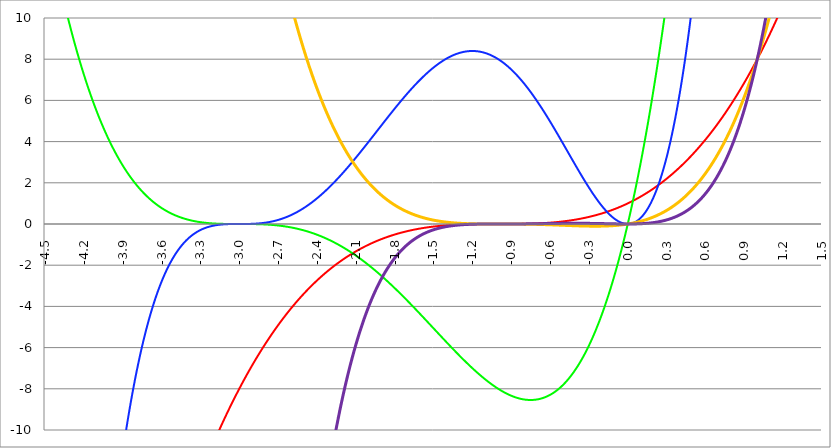
| Category | Series 1 | Series 0 | Series 2 | Series 3 | Series 4 |
|---|---|---|---|---|---|
| -4.5 | -42.875 | 15.188 | -68.344 | 192.938 | -868.219 |
| -4.497 | -42.765 | 15.086 | -67.844 | 192.314 | -864.834 |
| -4.494 | -42.655 | 14.986 | -67.347 | 191.691 | -861.459 |
| -4.491 | -42.545 | 14.886 | -66.853 | 191.07 | -858.096 |
| -4.488 | -42.436 | 14.786 | -66.361 | 190.451 | -854.742 |
| -4.484999999999999 | -42.326 | 14.687 | -65.873 | 189.833 | -851.399 |
| -4.482 | -42.217 | 14.589 | -65.387 | 189.216 | -848.067 |
| -4.479 | -42.108 | 14.491 | -64.903 | 188.601 | -844.745 |
| -4.476 | -41.999 | 14.393 | -64.423 | 187.988 | -841.433 |
| -4.472999999999999 | -41.89 | 14.296 | -63.945 | 187.376 | -838.131 |
| -4.469999999999999 | -41.782 | 14.199 | -63.47 | 186.765 | -834.84 |
| -4.466999999999999 | -41.674 | 14.103 | -62.997 | 186.156 | -831.56 |
| -4.463999999999999 | -41.566 | 14.007 | -62.528 | 185.549 | -828.289 |
| -4.460999999999998 | -41.458 | 13.912 | -62.06 | 184.943 | -825.029 |
| -4.457999999999998 | -41.35 | 13.817 | -61.596 | 184.338 | -821.779 |
| -4.454999999999998 | -41.242 | 13.723 | -61.134 | 183.735 | -818.539 |
| -4.451999999999998 | -41.135 | 13.629 | -60.675 | 183.133 | -815.31 |
| -4.448999999999998 | -41.028 | 13.535 | -60.219 | 182.533 | -812.09 |
| -4.445999999999998 | -40.921 | 13.442 | -59.765 | 181.935 | -808.881 |
| -4.442999999999998 | -40.814 | 13.35 | -59.313 | 181.337 | -805.682 |
| -4.439999999999997 | -40.708 | 13.258 | -58.864 | 180.742 | -802.493 |
| -4.436999999999997 | -40.601 | 13.166 | -58.418 | 180.147 | -799.314 |
| -4.433999999999997 | -40.495 | 13.075 | -57.975 | 179.555 | -796.145 |
| -4.430999999999997 | -40.389 | 12.984 | -57.534 | 178.963 | -792.986 |
| -4.427999999999997 | -40.283 | 12.894 | -57.095 | 178.373 | -789.837 |
| -4.424999999999997 | -40.177 | 12.804 | -56.659 | 177.785 | -786.698 |
| -4.421999999999997 | -40.072 | 12.715 | -56.226 | 177.198 | -783.569 |
| -4.418999999999997 | -39.967 | 12.626 | -55.795 | 176.612 | -780.45 |
| -4.415999999999997 | -39.861 | 12.538 | -55.367 | 176.028 | -777.341 |
| -4.412999999999997 | -39.757 | 12.45 | -54.941 | 175.446 | -774.242 |
| -4.409999999999996 | -39.652 | 12.362 | -54.517 | 174.865 | -771.153 |
| -4.406999999999996 | -39.547 | 12.275 | -54.096 | 174.285 | -768.073 |
| -4.403999999999996 | -39.443 | 12.188 | -53.678 | 173.706 | -765.003 |
| -4.400999999999996 | -39.339 | 12.102 | -53.262 | 173.13 | -761.943 |
| -4.397999999999996 | -39.235 | 12.016 | -52.848 | 172.554 | -758.893 |
| -4.394999999999996 | -39.131 | 11.931 | -52.437 | 171.98 | -755.853 |
| -4.391999999999996 | -39.027 | 11.846 | -52.029 | 171.408 | -752.822 |
| -4.388999999999996 | -38.924 | 11.762 | -51.622 | 170.836 | -749.801 |
| -4.385999999999996 | -38.82 | 11.678 | -51.219 | 170.267 | -746.789 |
| -4.382999999999996 | -38.717 | 11.594 | -50.817 | 169.698 | -743.788 |
| -4.379999999999995 | -38.614 | 11.511 | -50.418 | 169.131 | -740.795 |
| -4.376999999999995 | -38.512 | 11.428 | -50.021 | 168.566 | -737.813 |
| -4.373999999999995 | -38.409 | 11.346 | -49.627 | 168.002 | -734.84 |
| -4.370999999999995 | -38.307 | 11.264 | -49.235 | 167.439 | -731.877 |
| -4.367999999999995 | -38.205 | 11.183 | -48.845 | 166.878 | -728.923 |
| -4.364999999999995 | -38.103 | 11.102 | -48.458 | 166.318 | -725.978 |
| -4.361999999999995 | -38.001 | 11.021 | -48.073 | 165.76 | -723.044 |
| -4.358999999999995 | -37.899 | 10.941 | -47.691 | 165.203 | -720.118 |
| -4.355999999999994 | -37.798 | 10.861 | -47.31 | 164.647 | -717.202 |
| -4.352999999999994 | -37.696 | 10.782 | -46.932 | 164.093 | -714.296 |
| -4.349999999999994 | -37.595 | 10.703 | -46.556 | 163.54 | -711.398 |
| -4.346999999999994 | -37.494 | 10.624 | -46.183 | 162.988 | -708.511 |
| -4.343999999999994 | -37.394 | 10.546 | -45.812 | 162.438 | -705.632 |
| -4.340999999999994 | -37.293 | 10.468 | -45.443 | 161.89 | -702.763 |
| -4.337999999999994 | -37.193 | 10.391 | -45.076 | 161.342 | -699.903 |
| -4.334999999999994 | -37.093 | 10.314 | -44.712 | 160.797 | -697.053 |
| -4.331999999999994 | -36.993 | 10.238 | -44.35 | 160.252 | -694.212 |
| -4.328999999999993 | -36.893 | 10.162 | -43.99 | 159.709 | -691.38 |
| -4.325999999999993 | -36.793 | 10.086 | -43.632 | 159.167 | -688.557 |
| -4.322999999999993 | -36.694 | 10.011 | -43.276 | 158.627 | -685.743 |
| -4.319999999999993 | -36.594 | 9.936 | -42.923 | 158.088 | -682.939 |
| -4.316999999999993 | -36.495 | 9.861 | -42.572 | 157.55 | -680.143 |
| -4.313999999999993 | -36.396 | 9.787 | -42.223 | 157.014 | -677.357 |
| -4.310999999999993 | -36.298 | 9.714 | -41.876 | 156.479 | -674.58 |
| -4.307999999999993 | -36.199 | 9.64 | -41.531 | 155.945 | -671.812 |
| -4.304999999999993 | -36.101 | 9.568 | -41.189 | 155.413 | -669.053 |
| -4.301999999999992 | -36.002 | 9.495 | -40.848 | 154.882 | -666.303 |
| -4.298999999999992 | -35.904 | 9.423 | -40.51 | 154.353 | -663.563 |
| -4.295999999999992 | -35.806 | 9.351 | -40.174 | 153.825 | -660.831 |
| -4.292999999999992 | -35.709 | 9.28 | -39.84 | 153.298 | -658.108 |
| -4.289999999999992 | -35.611 | 9.209 | -39.508 | 152.772 | -655.394 |
| -4.286999999999992 | -35.514 | 9.139 | -39.178 | 152.248 | -652.689 |
| -4.283999999999992 | -35.417 | 9.069 | -38.85 | 151.726 | -649.993 |
| -4.280999999999992 | -35.32 | 8.999 | -38.525 | 151.204 | -647.305 |
| -4.277999999999992 | -35.223 | 8.93 | -38.201 | 150.684 | -644.627 |
| -4.274999999999991 | -35.126 | 8.861 | -37.879 | 150.165 | -641.957 |
| -4.271999999999991 | -35.03 | 8.792 | -37.56 | 149.648 | -639.297 |
| -4.268999999999991 | -34.934 | 8.724 | -37.242 | 149.132 | -636.645 |
| -4.265999999999991 | -34.838 | 8.656 | -36.927 | 148.617 | -634.001 |
| -4.262999999999991 | -34.742 | 8.589 | -36.613 | 148.104 | -631.367 |
| -4.259999999999991 | -34.646 | 8.522 | -36.302 | 147.592 | -628.741 |
| -4.256999999999991 | -34.55 | 8.455 | -35.993 | 147.081 | -626.124 |
| -4.253999999999991 | -34.455 | 8.389 | -35.685 | 146.572 | -623.516 |
| -4.250999999999991 | -34.36 | 8.323 | -35.38 | 146.064 | -620.916 |
| -4.24799999999999 | -34.265 | 8.257 | -35.076 | 145.557 | -618.325 |
| -4.24499999999999 | -34.17 | 8.192 | -34.775 | 145.051 | -615.743 |
| -4.24199999999999 | -34.075 | 8.127 | -34.475 | 144.547 | -613.169 |
| -4.23899999999999 | -33.981 | 8.063 | -34.178 | 144.044 | -610.604 |
| -4.23599999999999 | -33.886 | 7.999 | -33.882 | 143.543 | -608.047 |
| -4.23299999999999 | -33.792 | 7.935 | -33.588 | 143.043 | -605.499 |
| -4.22999999999999 | -33.698 | 7.871 | -33.296 | 142.544 | -602.96 |
| -4.22699999999999 | -33.604 | 7.808 | -33.006 | 142.046 | -600.429 |
| -4.22399999999999 | -33.511 | 7.746 | -32.718 | 141.55 | -597.906 |
| -4.220999999999989 | -33.417 | 7.684 | -32.432 | 141.055 | -595.392 |
| -4.217999999999989 | -33.324 | 7.622 | -32.148 | 140.561 | -592.886 |
| -4.214999999999989 | -33.231 | 7.56 | -31.866 | 140.069 | -590.389 |
| -4.21199999999999 | -33.138 | 7.499 | -31.585 | 139.577 | -587.9 |
| -4.208999999999989 | -33.045 | 7.438 | -31.307 | 139.087 | -585.419 |
| -4.205999999999989 | -32.953 | 7.378 | -31.03 | 138.599 | -582.947 |
| -4.202999999999989 | -32.86 | 7.317 | -30.755 | 138.112 | -580.483 |
| -4.199999999999989 | -32.768 | 7.258 | -30.482 | 137.626 | -578.028 |
| -4.196999999999988 | -32.676 | 7.198 | -30.211 | 137.141 | -575.58 |
| -4.193999999999988 | -32.584 | 7.139 | -29.941 | 136.657 | -573.141 |
| -4.190999999999988 | -32.492 | 7.08 | -29.674 | 136.175 | -570.71 |
| -4.187999999999988 | -32.401 | 7.022 | -29.408 | 135.694 | -568.288 |
| -4.184999999999988 | -32.309 | 6.964 | -29.144 | 135.215 | -565.873 |
| -4.181999999999988 | -32.218 | 6.906 | -28.882 | 134.736 | -563.467 |
| -4.178999999999988 | -32.127 | 6.849 | -28.621 | 134.259 | -561.069 |
| -4.175999999999988 | -32.036 | 6.792 | -28.362 | 133.783 | -558.679 |
| -4.172999999999988 | -31.946 | 6.735 | -28.105 | 133.309 | -556.297 |
| -4.169999999999987 | -31.855 | 6.679 | -27.85 | 132.835 | -553.924 |
| -4.166999999999987 | -31.765 | 6.623 | -27.597 | 132.363 | -551.558 |
| -4.163999999999987 | -31.674 | 6.567 | -27.345 | 131.893 | -549.2 |
| -4.160999999999987 | -31.584 | 6.512 | -27.095 | 131.423 | -546.851 |
| -4.157999999999987 | -31.495 | 6.457 | -26.847 | 130.955 | -544.509 |
| -4.154999999999987 | -31.405 | 6.402 | -26.6 | 130.488 | -542.176 |
| -4.151999999999987 | -31.315 | 6.348 | -26.356 | 130.022 | -539.85 |
| -4.148999999999987 | -31.226 | 6.294 | -26.112 | 129.557 | -537.533 |
| -4.145999999999987 | -31.137 | 6.24 | -25.871 | 129.094 | -535.223 |
| -4.142999999999986 | -31.048 | 6.187 | -25.631 | 128.632 | -532.921 |
| -4.139999999999986 | -30.959 | 6.134 | -25.393 | 128.171 | -530.627 |
| -4.136999999999986 | -30.87 | 6.081 | -25.157 | 127.711 | -528.341 |
| -4.133999999999986 | -30.782 | 6.029 | -24.922 | 127.253 | -526.063 |
| -4.130999999999986 | -30.694 | 5.976 | -24.689 | 126.796 | -523.793 |
| -4.127999999999986 | -30.606 | 5.925 | -24.457 | 126.34 | -521.53 |
| -4.124999999999986 | -30.518 | 5.873 | -24.227 | 125.885 | -519.276 |
| -4.121999999999986 | -30.43 | 5.822 | -23.999 | 125.432 | -517.029 |
| -4.118999999999986 | -30.342 | 5.771 | -23.772 | 124.979 | -514.79 |
| -4.115999999999985 | -30.255 | 5.721 | -23.547 | 124.528 | -512.558 |
| -4.112999999999985 | -30.167 | 5.671 | -23.324 | 124.078 | -510.334 |
| -4.109999999999985 | -30.08 | 5.621 | -23.102 | 123.63 | -508.118 |
| -4.106999999999985 | -29.993 | 5.571 | -22.882 | 123.182 | -505.91 |
| -4.103999999999985 | -29.906 | 5.522 | -22.663 | 122.736 | -503.709 |
| -4.100999999999985 | -29.82 | 5.473 | -22.446 | 122.291 | -501.516 |
| -4.097999999999985 | -29.733 | 5.425 | -22.231 | 121.847 | -499.331 |
| -4.094999999999985 | -29.647 | 5.376 | -22.017 | 121.405 | -497.153 |
| -4.091999999999984 | -29.561 | 5.328 | -21.804 | 120.963 | -494.982 |
| -4.088999999999984 | -29.475 | 5.281 | -21.593 | 120.523 | -492.82 |
| -4.085999999999984 | -29.389 | 5.233 | -21.384 | 120.084 | -490.664 |
| -4.082999999999984 | -29.304 | 5.186 | -21.176 | 119.646 | -488.517 |
| -4.079999999999984 | -29.218 | 5.14 | -20.97 | 119.21 | -486.376 |
| -4.076999999999984 | -29.133 | 5.093 | -20.765 | 118.774 | -484.244 |
| -4.073999999999984 | -29.048 | 5.047 | -20.562 | 118.34 | -482.118 |
| -4.070999999999984 | -28.963 | 5.001 | -20.36 | 117.907 | -480 |
| -4.067999999999984 | -28.878 | 4.956 | -20.159 | 117.475 | -477.89 |
| -4.064999999999984 | -28.793 | 4.91 | -19.96 | 117.045 | -475.787 |
| -4.061999999999983 | -28.709 | 4.865 | -19.763 | 116.615 | -473.691 |
| -4.058999999999983 | -28.625 | 4.821 | -19.567 | 116.187 | -471.603 |
| -4.055999999999983 | -28.54 | 4.776 | -19.373 | 115.76 | -469.522 |
| -4.052999999999983 | -28.456 | 4.732 | -19.18 | 115.334 | -467.448 |
| -4.049999999999983 | -28.373 | 4.688 | -18.988 | 114.909 | -465.382 |
| -4.046999999999983 | -28.289 | 4.645 | -18.798 | 114.486 | -463.323 |
| -4.043999999999983 | -28.206 | 4.602 | -18.609 | 114.063 | -461.271 |
| -4.040999999999983 | -28.122 | 4.559 | -18.422 | 113.642 | -459.227 |
| -4.037999999999982 | -28.039 | 4.516 | -18.236 | 113.222 | -457.189 |
| -4.034999999999982 | -27.956 | 4.474 | -18.051 | 112.803 | -455.159 |
| -4.031999999999982 | -27.873 | 4.432 | -17.868 | 112.385 | -453.136 |
| -4.028999999999982 | -27.791 | 4.39 | -17.686 | 111.968 | -451.12 |
| -4.025999999999982 | -27.708 | 4.348 | -17.506 | 111.553 | -449.112 |
| -4.022999999999982 | -27.626 | 4.307 | -17.327 | 111.138 | -447.11 |
| -4.019999999999982 | -27.544 | 4.266 | -17.15 | 110.725 | -445.116 |
| -4.016999999999982 | -27.462 | 4.225 | -16.973 | 110.313 | -443.128 |
| -4.013999999999982 | -27.38 | 4.185 | -16.798 | 109.902 | -441.148 |
| -4.010999999999981 | -27.298 | 4.145 | -16.625 | 109.493 | -439.175 |
| -4.007999999999981 | -27.217 | 4.105 | -16.453 | 109.084 | -437.209 |
| -4.004999999999981 | -27.135 | 4.065 | -16.282 | 108.677 | -435.25 |
| -4.001999999999981 | -27.054 | 4.026 | -16.112 | 108.27 | -433.298 |
| -3.998999999999981 | -26.973 | 3.987 | -15.944 | 107.865 | -431.352 |
| -3.995999999999981 | -26.892 | 3.948 | -15.777 | 107.461 | -429.414 |
| -3.992999999999981 | -26.811 | 3.91 | -15.612 | 107.058 | -427.483 |
| -3.989999999999981 | -26.731 | 3.871 | -15.447 | 106.656 | -425.559 |
| -3.986999999999981 | -26.651 | 3.834 | -15.284 | 106.256 | -423.641 |
| -3.98399999999998 | -26.57 | 3.796 | -15.123 | 105.856 | -421.731 |
| -3.98099999999998 | -26.49 | 3.758 | -14.962 | 105.458 | -419.827 |
| -3.97799999999998 | -26.41 | 3.721 | -14.803 | 105.06 | -417.93 |
| -3.97499999999998 | -26.331 | 3.684 | -14.645 | 104.664 | -416.04 |
| -3.97199999999998 | -26.251 | 3.648 | -14.488 | 104.269 | -414.157 |
| -3.96899999999998 | -26.172 | 3.611 | -14.333 | 103.875 | -412.28 |
| -3.96599999999998 | -26.092 | 3.575 | -14.179 | 103.482 | -410.411 |
| -3.96299999999998 | -26.013 | 3.539 | -14.026 | 103.091 | -408.548 |
| -3.95999999999998 | -25.934 | 3.504 | -13.874 | 102.7 | -406.692 |
| -3.956999999999979 | -25.856 | 3.468 | -13.724 | 102.31 | -404.842 |
| -3.953999999999979 | -25.777 | 3.433 | -13.574 | 101.922 | -403 |
| -3.950999999999979 | -25.698 | 3.398 | -13.426 | 101.535 | -401.164 |
| -3.94799999999998 | -25.62 | 3.364 | -13.279 | 101.149 | -399.334 |
| -3.944999999999979 | -25.542 | 3.329 | -13.134 | 100.763 | -397.512 |
| -3.941999999999979 | -25.464 | 3.295 | -12.989 | 100.379 | -395.696 |
| -3.938999999999979 | -25.386 | 3.261 | -12.846 | 99.996 | -393.886 |
| -3.935999999999979 | -25.309 | 3.228 | -12.704 | 99.615 | -392.083 |
| -3.932999999999978 | -25.231 | 3.194 | -12.563 | 99.234 | -390.287 |
| -3.929999999999978 | -25.154 | 3.161 | -12.423 | 98.854 | -388.497 |
| -3.926999999999978 | -25.077 | 3.128 | -12.285 | 98.476 | -386.714 |
| -3.923999999999978 | -25 | 3.096 | -12.147 | 98.098 | -384.937 |
| -3.920999999999978 | -24.923 | 3.063 | -12.011 | 97.722 | -383.167 |
| -3.917999999999978 | -24.846 | 3.031 | -11.876 | 97.346 | -381.404 |
| -3.914999999999978 | -24.769 | 2.999 | -11.742 | 96.972 | -379.646 |
| -3.911999999999978 | -24.693 | 2.967 | -11.609 | 96.599 | -377.896 |
| -3.908999999999978 | -24.617 | 2.936 | -11.477 | 96.227 | -376.151 |
| -3.905999999999977 | -24.541 | 2.905 | -11.346 | 95.856 | -374.413 |
| -3.902999999999977 | -24.465 | 2.874 | -11.217 | 95.486 | -372.682 |
| -3.899999999999977 | -24.389 | 2.843 | -11.088 | 95.117 | -370.957 |
| -3.896999999999977 | -24.313 | 2.813 | -10.961 | 94.749 | -369.238 |
| -3.893999999999977 | -24.238 | 2.782 | -10.834 | 94.383 | -367.525 |
| -3.890999999999977 | -24.163 | 2.752 | -10.709 | 94.017 | -365.819 |
| -3.887999999999977 | -24.087 | 2.722 | -10.585 | 93.652 | -364.12 |
| -3.884999999999977 | -24.013 | 2.693 | -10.462 | 93.289 | -362.426 |
| -3.881999999999977 | -23.938 | 2.664 | -10.34 | 92.926 | -360.739 |
| -3.878999999999976 | -23.863 | 2.634 | -10.219 | 92.565 | -359.058 |
| -3.875999999999976 | -23.788 | 2.606 | -10.099 | 92.204 | -357.383 |
| -3.872999999999976 | -23.714 | 2.577 | -9.98 | 91.845 | -355.715 |
| -3.869999999999976 | -23.64 | 2.548 | -9.862 | 91.486 | -354.052 |
| -3.866999999999976 | -23.566 | 2.52 | -9.746 | 91.129 | -352.396 |
| -3.863999999999976 | -23.492 | 2.492 | -9.63 | 90.773 | -350.746 |
| -3.860999999999976 | -23.418 | 2.464 | -9.515 | 90.418 | -349.103 |
| -3.857999999999976 | -23.345 | 2.437 | -9.401 | 90.064 | -347.465 |
| -3.854999999999976 | -23.271 | 2.409 | -9.289 | 89.71 | -345.834 |
| -3.851999999999975 | -23.198 | 2.382 | -9.177 | 89.358 | -344.208 |
| -3.848999999999975 | -23.125 | 2.355 | -9.066 | 89.007 | -342.589 |
| -3.845999999999975 | -23.052 | 2.329 | -8.956 | 88.657 | -340.976 |
| -3.842999999999975 | -22.979 | 2.302 | -8.848 | 88.308 | -339.368 |
| -3.839999999999975 | -22.906 | 2.276 | -8.74 | 87.96 | -337.767 |
| -3.836999999999975 | -22.834 | 2.25 | -8.633 | 87.613 | -336.172 |
| -3.833999999999975 | -22.761 | 2.224 | -8.527 | 87.267 | -334.583 |
| -3.830999999999975 | -22.689 | 2.198 | -8.422 | 86.922 | -333 |
| -3.827999999999974 | -22.617 | 2.173 | -8.318 | 86.579 | -331.423 |
| -3.824999999999974 | -22.545 | 2.148 | -8.215 | 86.236 | -329.851 |
| -3.821999999999974 | -22.474 | 2.123 | -8.113 | 85.894 | -328.286 |
| -3.818999999999974 | -22.402 | 2.098 | -8.012 | 85.553 | -326.727 |
| -3.815999999999974 | -22.33 | 2.073 | -7.912 | 85.213 | -325.173 |
| -3.812999999999974 | -22.259 | 2.049 | -7.813 | 84.874 | -323.626 |
| -3.809999999999974 | -22.188 | 2.025 | -7.714 | 84.536 | -322.084 |
| -3.806999999999974 | -22.117 | 2.001 | -7.617 | 84.2 | -320.548 |
| -3.803999999999974 | -22.046 | 1.977 | -7.521 | 83.864 | -319.018 |
| -3.800999999999973 | -21.976 | 1.953 | -7.425 | 83.529 | -317.494 |
| -3.797999999999973 | -21.905 | 1.93 | -7.33 | 83.195 | -315.975 |
| -3.794999999999973 | -21.835 | 1.907 | -7.236 | 82.862 | -314.463 |
| -3.791999999999973 | -21.764 | 1.884 | -7.144 | 82.531 | -312.956 |
| -3.788999999999973 | -21.694 | 1.861 | -7.051 | 82.2 | -311.455 |
| -3.785999999999973 | -21.624 | 1.838 | -6.96 | 81.87 | -309.959 |
| -3.782999999999973 | -21.555 | 1.816 | -6.87 | 81.541 | -308.47 |
| -3.779999999999973 | -21.485 | 1.794 | -6.781 | 81.213 | -306.986 |
| -3.776999999999973 | -21.415 | 1.772 | -6.692 | 80.886 | -305.507 |
| -3.773999999999972 | -21.346 | 1.75 | -6.604 | 80.56 | -304.035 |
| -3.770999999999972 | -21.277 | 1.728 | -6.517 | 80.235 | -302.568 |
| -3.767999999999972 | -21.208 | 1.707 | -6.431 | 79.911 | -301.106 |
| -3.764999999999972 | -21.139 | 1.686 | -6.346 | 79.589 | -299.651 |
| -3.761999999999972 | -21.07 | 1.664 | -6.262 | 79.267 | -298.201 |
| -3.758999999999972 | -21.002 | 1.644 | -6.178 | 78.946 | -296.756 |
| -3.755999999999972 | -20.933 | 1.623 | -6.096 | 78.625 | -295.317 |
| -3.752999999999972 | -20.865 | 1.602 | -6.014 | 78.306 | -293.884 |
| -3.749999999999972 | -20.797 | 1.582 | -5.933 | 77.988 | -292.456 |
| -3.746999999999971 | -20.729 | 1.562 | -5.852 | 77.671 | -291.034 |
| -3.743999999999971 | -20.661 | 1.542 | -5.773 | 77.355 | -289.617 |
| -3.740999999999971 | -20.593 | 1.522 | -5.694 | 77.04 | -288.206 |
| -3.737999999999971 | -20.526 | 1.502 | -5.616 | 76.725 | -286.8 |
| -3.734999999999971 | -20.458 | 1.483 | -5.539 | 76.412 | -285.399 |
| -3.731999999999971 | -20.391 | 1.464 | -5.463 | 76.1 | -284.005 |
| -3.728999999999971 | -20.324 | 1.445 | -5.387 | 75.788 | -282.615 |
| -3.725999999999971 | -20.257 | 1.426 | -5.312 | 75.478 | -281.231 |
| -3.72299999999997 | -20.19 | 1.407 | -5.238 | 75.169 | -279.852 |
| -3.71999999999997 | -20.124 | 1.388 | -5.165 | 74.86 | -278.479 |
| -3.71699999999997 | -20.057 | 1.37 | -5.093 | 74.552 | -277.111 |
| -3.71399999999997 | -19.991 | 1.352 | -5.021 | 74.246 | -275.749 |
| -3.71099999999997 | -19.925 | 1.334 | -4.95 | 73.94 | -274.391 |
| -3.70799999999997 | -19.858 | 1.316 | -4.88 | 73.635 | -273.039 |
| -3.70499999999997 | -19.793 | 1.298 | -4.81 | 73.331 | -271.693 |
| -3.70199999999997 | -19.727 | 1.281 | -4.741 | 73.029 | -270.352 |
| -3.69899999999997 | -19.661 | 1.263 | -4.673 | 72.727 | -269.016 |
| -3.695999999999969 | -19.596 | 1.246 | -4.606 | 72.426 | -267.685 |
| -3.692999999999969 | -19.53 | 1.229 | -4.539 | 72.125 | -266.359 |
| -3.689999999999969 | -19.465 | 1.212 | -4.473 | 71.826 | -265.039 |
| -3.686999999999969 | -19.4 | 1.195 | -4.408 | 71.528 | -263.724 |
| -3.683999999999969 | -19.335 | 1.179 | -4.343 | 71.231 | -262.414 |
| -3.680999999999969 | -19.27 | 1.163 | -4.279 | 70.934 | -261.109 |
| -3.677999999999969 | -19.206 | 1.146 | -4.216 | 70.639 | -259.81 |
| -3.674999999999969 | -19.141 | 1.13 | -4.154 | 70.344 | -258.515 |
| -3.671999999999969 | -19.077 | 1.114 | -4.092 | 70.051 | -257.226 |
| -3.668999999999968 | -19.013 | 1.099 | -4.031 | 69.758 | -255.942 |
| -3.665999999999968 | -18.949 | 1.083 | -3.97 | 69.466 | -254.663 |
| -3.662999999999968 | -18.885 | 1.068 | -3.91 | 69.175 | -253.389 |
| -3.659999999999968 | -18.821 | 1.052 | -3.851 | 68.885 | -252.12 |
| -3.656999999999968 | -18.757 | 1.037 | -3.793 | 68.596 | -250.856 |
| -3.653999999999968 | -18.694 | 1.022 | -3.735 | 68.308 | -249.597 |
| -3.650999999999968 | -18.631 | 1.007 | -3.678 | 68.021 | -248.344 |
| -3.647999999999968 | -18.568 | 0.993 | -3.621 | 67.734 | -247.095 |
| -3.644999999999968 | -18.504 | 0.978 | -3.565 | 67.449 | -245.851 |
| -3.641999999999967 | -18.442 | 0.964 | -3.51 | 67.164 | -244.612 |
| -3.638999999999967 | -18.379 | 0.949 | -3.455 | 66.881 | -243.379 |
| -3.635999999999967 | -18.316 | 0.935 | -3.401 | 66.598 | -242.15 |
| -3.632999999999967 | -18.254 | 0.921 | -3.348 | 66.316 | -240.926 |
| -3.629999999999967 | -18.191 | 0.908 | -3.295 | 66.035 | -239.707 |
| -3.626999999999967 | -18.129 | 0.894 | -3.243 | 65.755 | -238.493 |
| -3.623999999999967 | -18.067 | 0.881 | -3.191 | 65.476 | -237.284 |
| -3.620999999999967 | -18.005 | 0.867 | -3.14 | 65.197 | -236.079 |
| -3.617999999999966 | -17.944 | 0.854 | -3.09 | 64.92 | -234.88 |
| -3.614999999999966 | -17.882 | 0.841 | -3.04 | 64.643 | -233.685 |
| -3.611999999999966 | -17.82 | 0.828 | -2.991 | 64.368 | -232.496 |
| -3.608999999999966 | -17.759 | 0.815 | -2.942 | 64.093 | -231.311 |
| -3.605999999999966 | -17.698 | 0.802 | -2.894 | 63.819 | -230.131 |
| -3.602999999999966 | -17.637 | 0.79 | -2.846 | 63.546 | -228.955 |
| -3.599999999999966 | -17.576 | 0.778 | -2.799 | 63.274 | -227.785 |
| -3.596999999999966 | -17.515 | 0.765 | -2.753 | 63.002 | -226.619 |
| -3.593999999999966 | -17.455 | 0.753 | -2.707 | 62.732 | -225.458 |
| -3.590999999999966 | -17.394 | 0.741 | -2.662 | 62.462 | -224.302 |
| -3.587999999999965 | -17.334 | 0.729 | -2.617 | 62.194 | -223.15 |
| -3.584999999999965 | -17.274 | 0.718 | -2.573 | 61.926 | -222.004 |
| -3.581999999999965 | -17.213 | 0.706 | -2.529 | 61.659 | -220.861 |
| -3.578999999999965 | -17.154 | 0.695 | -2.486 | 61.393 | -219.724 |
| -3.575999999999965 | -17.094 | 0.683 | -2.444 | 61.127 | -218.591 |
| -3.572999999999965 | -17.034 | 0.672 | -2.402 | 60.863 | -217.463 |
| -3.569999999999965 | -16.975 | 0.661 | -2.36 | 60.599 | -216.339 |
| -3.566999999999965 | -16.915 | 0.65 | -2.319 | 60.337 | -215.221 |
| -3.563999999999965 | -16.856 | 0.639 | -2.279 | 60.075 | -214.106 |
| -3.560999999999964 | -16.797 | 0.629 | -2.239 | 59.814 | -212.997 |
| -3.557999999999964 | -16.738 | 0.618 | -2.199 | 59.554 | -211.891 |
| -3.554999999999964 | -16.679 | 0.608 | -2.161 | 59.294 | -210.791 |
| -3.551999999999964 | -16.62 | 0.597 | -2.122 | 59.036 | -209.695 |
| -3.548999999999964 | -16.562 | 0.587 | -2.084 | 58.778 | -208.603 |
| -3.545999999999964 | -16.503 | 0.577 | -2.047 | 58.521 | -207.517 |
| -3.542999999999964 | -16.445 | 0.567 | -2.01 | 58.265 | -206.434 |
| -3.539999999999964 | -16.387 | 0.557 | -1.973 | 58.01 | -205.356 |
| -3.536999999999963 | -16.329 | 0.548 | -1.937 | 57.756 | -204.283 |
| -3.533999999999963 | -16.271 | 0.538 | -1.902 | 57.502 | -203.214 |
| -3.530999999999963 | -16.213 | 0.529 | -1.867 | 57.25 | -202.149 |
| -3.527999999999963 | -16.156 | 0.519 | -1.832 | 56.998 | -201.089 |
| -3.524999999999963 | -16.098 | 0.51 | -1.798 | 56.747 | -200.033 |
| -3.521999999999963 | -16.041 | 0.501 | -1.764 | 56.497 | -198.982 |
| -3.518999999999963 | -15.984 | 0.492 | -1.731 | 56.248 | -197.935 |
| -3.515999999999963 | -15.927 | 0.483 | -1.698 | 55.999 | -196.893 |
| -3.512999999999963 | -15.87 | 0.474 | -1.666 | 55.751 | -195.855 |
| -3.509999999999962 | -15.813 | 0.466 | -1.634 | 55.505 | -194.821 |
| -3.506999999999962 | -15.757 | 0.457 | -1.603 | 55.258 | -193.791 |
| -3.503999999999962 | -15.7 | 0.449 | -1.572 | 55.013 | -192.766 |
| -3.500999999999962 | -15.644 | 0.44 | -1.541 | 54.769 | -191.746 |
| -3.497999999999962 | -15.588 | 0.432 | -1.511 | 54.525 | -190.729 |
| -3.494999999999962 | -15.531 | 0.424 | -1.482 | 54.282 | -189.717 |
| -3.491999999999962 | -15.475 | 0.416 | -1.452 | 54.04 | -188.709 |
| -3.488999999999962 | -15.42 | 0.408 | -1.423 | 53.799 | -187.705 |
| -3.485999999999962 | -15.364 | 0.4 | -1.395 | 53.559 | -186.706 |
| -3.482999999999961 | -15.308 | 0.392 | -1.367 | 53.319 | -185.711 |
| -3.479999999999961 | -15.253 | 0.385 | -1.339 | 53.08 | -184.72 |
| -3.476999999999961 | -15.198 | 0.377 | -1.312 | 52.842 | -183.733 |
| -3.473999999999961 | -15.143 | 0.37 | -1.285 | 52.605 | -182.751 |
| -3.470999999999961 | -15.088 | 0.363 | -1.259 | 52.369 | -181.772 |
| -3.467999999999961 | -15.033 | 0.355 | -1.233 | 52.133 | -180.798 |
| -3.464999999999961 | -14.978 | 0.348 | -1.207 | 51.898 | -179.828 |
| -3.461999999999961 | -14.923 | 0.341 | -1.182 | 51.664 | -178.862 |
| -3.458999999999961 | -14.869 | 0.334 | -1.157 | 51.431 | -177.9 |
| -3.45599999999996 | -14.814 | 0.328 | -1.133 | 51.199 | -176.943 |
| -3.45299999999996 | -14.76 | 0.321 | -1.108 | 50.967 | -175.989 |
| -3.44999999999996 | -14.706 | 0.314 | -1.085 | 50.736 | -175.04 |
| -3.44699999999996 | -14.652 | 0.308 | -1.061 | 50.506 | -174.094 |
| -3.44399999999996 | -14.598 | 0.301 | -1.038 | 50.277 | -173.153 |
| -3.44099999999996 | -14.545 | 0.295 | -1.016 | 50.048 | -172.216 |
| -3.43799999999996 | -14.491 | 0.289 | -0.993 | 49.82 | -171.282 |
| -3.43499999999996 | -14.438 | 0.283 | -0.971 | 49.593 | -170.353 |
| -3.431999999999959 | -14.384 | 0.277 | -0.95 | 49.367 | -169.428 |
| -3.428999999999959 | -14.331 | 0.271 | -0.928 | 49.142 | -168.507 |
| -3.425999999999959 | -14.278 | 0.265 | -0.907 | 48.917 | -167.59 |
| -3.422999999999959 | -14.225 | 0.259 | -0.887 | 48.693 | -166.676 |
| -3.419999999999959 | -14.172 | 0.253 | -0.867 | 48.47 | -165.767 |
| -3.416999999999959 | -14.12 | 0.248 | -0.847 | 48.248 | -164.862 |
| -3.413999999999959 | -14.067 | 0.242 | -0.827 | 48.026 | -163.96 |
| -3.410999999999959 | -14.015 | 0.237 | -0.808 | 47.805 | -163.063 |
| -3.407999999999959 | -13.963 | 0.231 | -0.789 | 47.585 | -162.169 |
| -3.404999999999958 | -13.911 | 0.226 | -0.77 | 47.366 | -161.28 |
| -3.401999999999958 | -13.859 | 0.221 | -0.752 | 47.147 | -160.394 |
| -3.398999999999958 | -13.807 | 0.216 | -0.734 | 46.929 | -159.512 |
| -3.395999999999958 | -13.755 | 0.211 | -0.716 | 46.712 | -158.634 |
| -3.392999999999958 | -13.703 | 0.206 | -0.699 | 46.496 | -157.76 |
| -3.389999999999958 | -13.652 | 0.201 | -0.682 | 46.28 | -156.889 |
| -3.386999999999958 | -13.601 | 0.196 | -0.665 | 46.065 | -156.023 |
| -3.383999999999958 | -13.549 | 0.192 | -0.648 | 45.851 | -155.16 |
| -3.380999999999958 | -13.498 | 0.187 | -0.632 | 45.638 | -154.301 |
| -3.377999999999957 | -13.447 | 0.182 | -0.616 | 45.425 | -153.446 |
| -3.374999999999957 | -13.396 | 0.178 | -0.601 | 45.213 | -152.594 |
| -3.371999999999957 | -13.346 | 0.174 | -0.585 | 45.002 | -151.747 |
| -3.368999999999957 | -13.295 | 0.169 | -0.57 | 44.792 | -150.903 |
| -3.365999999999957 | -13.245 | 0.165 | -0.555 | 44.582 | -150.063 |
| -3.362999999999957 | -13.194 | 0.161 | -0.541 | 44.373 | -149.226 |
| -3.359999999999957 | -13.144 | 0.157 | -0.527 | 44.165 | -148.393 |
| -3.356999999999957 | -13.094 | 0.153 | -0.513 | 43.957 | -147.564 |
| -3.353999999999957 | -13.044 | 0.149 | -0.499 | 43.75 | -146.739 |
| -3.350999999999956 | -12.994 | 0.145 | -0.486 | 43.544 | -145.917 |
| -3.347999999999956 | -12.945 | 0.141 | -0.472 | 43.339 | -145.099 |
| -3.344999999999956 | -12.895 | 0.137 | -0.459 | 43.134 | -144.285 |
| -3.341999999999956 | -12.846 | 0.134 | -0.447 | 42.931 | -143.474 |
| -3.338999999999956 | -12.796 | 0.13 | -0.434 | 42.727 | -142.667 |
| -3.335999999999956 | -12.747 | 0.127 | -0.422 | 42.525 | -141.863 |
| -3.332999999999956 | -12.698 | 0.123 | -0.41 | 42.323 | -141.064 |
| -3.329999999999956 | -12.649 | 0.12 | -0.399 | 42.122 | -140.267 |
| -3.326999999999955 | -12.601 | 0.116 | -0.387 | 41.922 | -139.474 |
| -3.323999999999955 | -12.552 | 0.113 | -0.376 | 41.722 | -138.685 |
| -3.320999999999955 | -12.503 | 0.11 | -0.365 | 41.524 | -137.9 |
| -3.317999999999955 | -12.455 | 0.107 | -0.354 | 41.325 | -137.118 |
| -3.314999999999955 | -12.407 | 0.104 | -0.343 | 41.128 | -136.339 |
| -3.311999999999955 | -12.358 | 0.101 | -0.333 | 40.931 | -135.564 |
| -3.308999999999955 | -12.31 | 0.098 | -0.323 | 40.735 | -134.792 |
| -3.305999999999955 | -12.262 | 0.095 | -0.313 | 40.54 | -134.024 |
| -3.302999999999955 | -12.215 | 0.092 | -0.303 | 40.345 | -133.26 |
| -3.299999999999954 | -12.167 | 0.089 | -0.294 | 40.151 | -132.499 |
| -3.296999999999954 | -12.119 | 0.086 | -0.285 | 39.958 | -131.741 |
| -3.293999999999954 | -12.072 | 0.084 | -0.276 | 39.765 | -130.987 |
| -3.290999999999954 | -12.025 | 0.081 | -0.267 | 39.573 | -130.236 |
| -3.287999999999954 | -11.978 | 0.079 | -0.258 | 39.382 | -129.489 |
| -3.284999999999954 | -11.93 | 0.076 | -0.25 | 39.192 | -128.745 |
| -3.281999999999954 | -11.884 | 0.074 | -0.242 | 39.002 | -128.004 |
| -3.278999999999954 | -11.837 | 0.071 | -0.234 | 38.813 | -127.267 |
| -3.275999999999954 | -11.79 | 0.069 | -0.226 | 38.624 | -126.533 |
| -3.272999999999953 | -11.744 | 0.067 | -0.218 | 38.437 | -125.803 |
| -3.269999999999953 | -11.697 | 0.064 | -0.21 | 38.249 | -125.076 |
| -3.266999999999953 | -11.651 | 0.062 | -0.203 | 38.063 | -124.352 |
| -3.263999999999953 | -11.605 | 0.06 | -0.196 | 37.877 | -123.632 |
| -3.260999999999953 | -11.559 | 0.058 | -0.189 | 37.692 | -122.915 |
| -3.257999999999953 | -11.513 | 0.056 | -0.182 | 37.508 | -122.201 |
| -3.254999999999953 | -11.467 | 0.054 | -0.176 | 37.324 | -121.49 |
| -3.251999999999953 | -11.421 | 0.052 | -0.169 | 37.141 | -120.783 |
| -3.248999999999952 | -11.375 | 0.05 | -0.163 | 36.959 | -120.079 |
| -3.245999999999952 | -11.33 | 0.048 | -0.157 | 36.777 | -119.379 |
| -3.242999999999952 | -11.285 | 0.047 | -0.151 | 36.596 | -118.681 |
| -3.239999999999952 | -11.239 | 0.045 | -0.145 | 36.416 | -117.987 |
| -3.236999999999952 | -11.194 | 0.043 | -0.139 | 36.236 | -117.296 |
| -3.233999999999952 | -11.149 | 0.041 | -0.134 | 36.057 | -116.608 |
| -3.230999999999952 | -11.104 | 0.04 | -0.129 | 35.879 | -115.924 |
| -3.227999999999952 | -11.06 | 0.038 | -0.124 | 35.701 | -115.242 |
| -3.224999999999952 | -11.015 | 0.037 | -0.118 | 35.524 | -114.564 |
| -3.221999999999952 | -10.971 | 0.035 | -0.114 | 35.347 | -113.889 |
| -3.218999999999951 | -10.926 | 0.034 | -0.109 | 35.172 | -113.218 |
| -3.215999999999951 | -10.882 | 0.032 | -0.104 | 34.997 | -112.549 |
| -3.212999999999951 | -10.838 | 0.031 | -0.1 | 34.822 | -111.883 |
| -3.209999999999951 | -10.794 | 0.03 | -0.095 | 34.648 | -111.221 |
| -3.206999999999951 | -10.75 | 0.028 | -0.091 | 34.475 | -110.562 |
| -3.203999999999951 | -10.706 | 0.027 | -0.087 | 34.303 | -109.906 |
| -3.200999999999951 | -10.663 | 0.026 | -0.083 | 34.131 | -109.253 |
| -3.197999999999951 | -10.619 | 0.025 | -0.079 | 33.96 | -108.603 |
| -3.194999999999951 | -10.576 | 0.024 | -0.076 | 33.789 | -107.956 |
| -3.19199999999995 | -10.532 | 0.023 | -0.072 | 33.619 | -107.312 |
| -3.18899999999995 | -10.489 | 0.022 | -0.069 | 33.45 | -106.671 |
| -3.18599999999995 | -10.446 | 0.021 | -0.065 | 33.281 | -106.033 |
| -3.18299999999995 | -10.403 | 0.02 | -0.062 | 33.113 | -105.399 |
| -3.17999999999995 | -10.36 | 0.019 | -0.059 | 32.946 | -104.767 |
| -3.17699999999995 | -10.318 | 0.018 | -0.056 | 32.779 | -104.138 |
| -3.17399999999995 | -10.275 | 0.017 | -0.053 | 32.613 | -103.512 |
| -3.17099999999995 | -10.232 | 0.016 | -0.05 | 32.447 | -102.89 |
| -3.16799999999995 | -10.19 | 0.015 | -0.048 | 32.282 | -102.27 |
| -3.164999999999949 | -10.148 | 0.014 | -0.045 | 32.118 | -101.653 |
| -3.161999999999949 | -10.106 | 0.013 | -0.043 | 31.954 | -101.039 |
| -3.158999999999949 | -10.064 | 0.013 | -0.04 | 31.791 | -100.429 |
| -3.155999999999949 | -10.022 | 0.012 | -0.038 | 31.629 | -99.821 |
| -3.152999999999949 | -9.98 | 0.011 | -0.036 | 31.467 | -99.216 |
| -3.149999999999949 | -9.938 | 0.011 | -0.033 | 31.306 | -98.614 |
| -3.146999999999949 | -9.897 | 0.01 | -0.031 | 31.145 | -98.014 |
| -3.143999999999949 | -9.855 | 0.009 | -0.03 | 30.985 | -97.418 |
| -3.140999999999948 | -9.814 | 0.009 | -0.028 | 30.826 | -96.825 |
| -3.137999999999948 | -9.773 | 0.008 | -0.026 | 30.667 | -96.234 |
| -3.134999999999948 | -9.732 | 0.008 | -0.024 | 30.509 | -95.646 |
| -3.131999999999948 | -9.691 | 0.007 | -0.023 | 30.352 | -95.062 |
| -3.128999999999948 | -9.65 | 0.007 | -0.021 | 30.195 | -94.48 |
| -3.125999999999948 | -9.609 | 0.006 | -0.02 | 30.039 | -93.9 |
| -3.122999999999948 | -9.569 | 0.006 | -0.018 | 29.883 | -93.324 |
| -3.119999999999948 | -9.528 | 0.005 | -0.017 | 29.728 | -92.751 |
| -3.116999999999948 | -9.488 | 0.005 | -0.016 | 29.573 | -92.18 |
| -3.113999999999947 | -9.447 | 0.005 | -0.014 | 29.419 | -91.612 |
| -3.110999999999947 | -9.407 | 0.004 | -0.013 | 29.266 | -91.047 |
| -3.107999999999947 | -9.367 | 0.004 | -0.012 | 29.113 | -90.484 |
| -3.104999999999947 | -9.327 | 0.004 | -0.011 | 28.961 | -89.925 |
| -3.101999999999947 | -9.287 | 0.003 | -0.01 | 28.81 | -89.368 |
| -3.098999999999947 | -9.248 | 0.003 | -0.009 | 28.659 | -88.814 |
| -3.095999999999947 | -9.208 | 0.003 | -0.008 | 28.509 | -88.262 |
| -3.092999999999947 | -9.169 | 0.002 | -0.008 | 28.359 | -87.714 |
| -3.089999999999947 | -9.129 | 0.002 | -0.007 | 28.21 | -87.168 |
| -3.086999999999946 | -9.09 | 0.002 | -0.006 | 28.061 | -86.624 |
| -3.083999999999946 | -9.051 | 0.002 | -0.006 | 27.913 | -86.084 |
| -3.080999999999946 | -9.012 | 0.002 | -0.005 | 27.766 | -85.546 |
| -3.077999999999946 | -8.973 | 0.001 | -0.004 | 27.619 | -85.011 |
| -3.074999999999946 | -8.934 | 0.001 | -0.004 | 27.473 | -84.478 |
| -3.071999999999946 | -8.895 | 0.001 | -0.004 | 27.327 | -83.948 |
| -3.068999999999946 | -8.857 | 0.001 | -0.003 | 27.182 | -83.421 |
| -3.065999999999946 | -8.818 | 0.001 | -0.003 | 27.037 | -82.896 |
| -3.062999999999946 | -8.78 | 0.001 | -0.002 | 26.893 | -82.374 |
| -3.059999999999945 | -8.742 | 0.001 | -0.002 | 26.75 | -81.855 |
| -3.056999999999945 | -8.704 | 0.001 | -0.002 | 26.607 | -81.338 |
| -3.053999999999945 | -8.666 | 0 | -0.001 | 26.465 | -80.824 |
| -3.050999999999945 | -8.628 | 0 | -0.001 | 26.323 | -80.312 |
| -3.047999999999945 | -8.59 | 0 | -0.001 | 26.182 | -79.803 |
| -3.044999999999945 | -8.552 | 0 | -0.001 | 26.042 | -79.297 |
| -3.041999999999945 | -8.515 | 0 | -0.001 | 25.902 | -78.793 |
| -3.038999999999945 | -8.477 | 0 | -0.001 | 25.762 | -78.291 |
| -3.035999999999945 | -8.44 | 0 | 0 | 25.623 | -77.792 |
| -3.032999999999944 | -8.403 | 0 | 0 | 25.485 | -77.296 |
| -3.029999999999944 | -8.365 | 0 | 0 | 25.347 | -76.802 |
| -3.026999999999944 | -8.328 | 0 | 0 | 25.21 | -76.311 |
| -3.023999999999944 | -8.291 | 0 | 0 | 25.073 | -75.822 |
| -3.020999999999944 | -8.255 | 0 | 0 | 24.937 | -75.336 |
| -3.017999999999944 | -8.218 | 0 | 0 | 24.802 | -74.852 |
| -3.014999999999944 | -8.181 | 0 | 0 | 24.667 | -74.37 |
| -3.011999999999944 | -8.145 | 0 | 0 | 24.532 | -73.891 |
| -3.008999999999943 | -8.108 | 0 | 0 | 24.398 | -73.415 |
| -3.005999999999943 | -8.072 | 0 | 0 | 24.265 | -72.941 |
| -3.002999999999943 | -8.036 | 0 | 0 | 24.132 | -72.469 |
| -2.999999999999943 | -8 | 0 | 0 | 24 | -72 |
| -2.996999999999943 | -7.964 | 0 | 0 | 23.868 | -71.533 |
| -2.993999999999943 | -7.928 | 0 | 0 | 23.737 | -71.069 |
| -2.990999999999943 | -7.892 | 0 | 0 | 23.606 | -70.607 |
| -2.987999999999943 | -7.857 | 0 | 0 | 23.476 | -70.147 |
| -2.984999999999943 | -7.821 | 0 | 0 | 23.347 | -69.69 |
| -2.981999999999942 | -7.786 | 0 | 0 | 23.218 | -69.235 |
| -2.978999999999942 | -7.751 | 0 | 0 | 23.089 | -68.783 |
| -2.975999999999942 | -7.715 | 0 | 0 | 22.961 | -68.332 |
| -2.972999999999942 | -7.68 | 0 | 0 | 22.834 | -67.885 |
| -2.969999999999942 | -7.645 | 0 | 0 | 22.707 | -67.439 |
| -2.966999999999942 | -7.61 | 0 | 0 | 22.58 | -66.996 |
| -2.963999999999942 | -7.576 | 0 | 0 | 22.454 | -66.555 |
| -2.960999999999942 | -7.541 | 0 | 0.001 | 22.329 | -66.116 |
| -2.957999999999942 | -7.507 | 0 | 0.001 | 22.204 | -65.68 |
| -2.954999999999941 | -7.472 | 0 | 0.001 | 22.08 | -65.246 |
| -2.951999999999941 | -7.438 | 0 | 0.001 | 21.956 | -64.814 |
| -2.948999999999941 | -7.403 | 0 | 0.001 | 21.833 | -64.385 |
| -2.945999999999941 | -7.369 | 0 | 0.001 | 21.71 | -63.958 |
| -2.942999999999941 | -7.335 | -0.001 | 0.002 | 21.588 | -63.533 |
| -2.939999999999941 | -7.301 | -0.001 | 0.002 | 21.466 | -63.11 |
| -2.936999999999941 | -7.268 | -0.001 | 0.002 | 21.345 | -62.69 |
| -2.933999999999941 | -7.234 | -0.001 | 0.002 | 21.224 | -62.272 |
| -2.930999999999941 | -7.2 | -0.001 | 0.003 | 21.104 | -61.856 |
| -2.92799999999994 | -7.167 | -0.001 | 0.003 | 20.984 | -61.442 |
| -2.92499999999994 | -7.133 | -0.001 | 0.004 | 20.865 | -61.03 |
| -2.92199999999994 | -7.1 | -0.001 | 0.004 | 20.746 | -60.621 |
| -2.91899999999994 | -7.067 | -0.002 | 0.005 | 20.628 | -60.213 |
| -2.91599999999994 | -7.034 | -0.002 | 0.005 | 20.51 | -59.808 |
| -2.91299999999994 | -7.001 | -0.002 | 0.006 | 20.393 | -59.405 |
| -2.90999999999994 | -6.968 | -0.002 | 0.006 | 20.277 | -59.005 |
| -2.90699999999994 | -6.935 | -0.002 | 0.007 | 20.16 | -58.606 |
| -2.903999999999939 | -6.902 | -0.003 | 0.007 | 20.045 | -58.21 |
| -2.900999999999939 | -6.87 | -0.003 | 0.008 | 19.929 | -57.815 |
| -2.897999999999939 | -6.837 | -0.003 | 0.009 | 19.815 | -57.423 |
| -2.894999999999939 | -6.805 | -0.003 | 0.01 | 19.7 | -57.033 |
| -2.891999999999939 | -6.773 | -0.004 | 0.011 | 19.587 | -56.645 |
| -2.888999999999939 | -6.741 | -0.004 | 0.011 | 19.473 | -56.259 |
| -2.885999999999939 | -6.708 | -0.004 | 0.012 | 19.361 | -55.875 |
| -2.882999999999939 | -6.677 | -0.005 | 0.013 | 19.248 | -55.493 |
| -2.879999999999939 | -6.645 | -0.005 | 0.014 | 19.137 | -55.114 |
| -2.876999999999938 | -6.613 | -0.005 | 0.015 | 19.025 | -54.736 |
| -2.873999999999938 | -6.581 | -0.006 | 0.017 | 18.915 | -54.36 |
| -2.870999999999938 | -6.55 | -0.006 | 0.018 | 18.804 | -53.987 |
| -2.867999999999938 | -6.518 | -0.007 | 0.019 | 18.694 | -53.615 |
| -2.864999999999938 | -6.487 | -0.007 | 0.02 | 18.585 | -53.246 |
| -2.861999999999938 | -6.456 | -0.008 | 0.022 | 18.476 | -52.878 |
| -2.858999999999938 | -6.424 | -0.008 | 0.023 | 18.368 | -52.513 |
| -2.855999999999938 | -6.393 | -0.009 | 0.024 | 18.26 | -52.15 |
| -2.852999999999938 | -6.362 | -0.009 | 0.026 | 18.152 | -51.788 |
| -2.849999999999937 | -6.332 | -0.01 | 0.027 | 18.045 | -51.429 |
| -2.846999999999937 | -6.301 | -0.01 | 0.029 | 17.939 | -51.071 |
| -2.843999999999937 | -6.27 | -0.011 | 0.031 | 17.833 | -50.716 |
| -2.840999999999937 | -6.24 | -0.011 | 0.032 | 17.727 | -50.362 |
| -2.837999999999937 | -6.209 | -0.012 | 0.034 | 17.622 | -50.011 |
| -2.834999999999937 | -6.179 | -0.013 | 0.036 | 17.517 | -49.661 |
| -2.831999999999937 | -6.149 | -0.013 | 0.038 | 17.413 | -49.313 |
| -2.828999999999937 | -6.118 | -0.014 | 0.04 | 17.309 | -48.967 |
| -2.825999999999937 | -6.088 | -0.015 | 0.042 | 17.206 | -48.624 |
| -2.822999999999936 | -6.058 | -0.016 | 0.044 | 17.103 | -48.282 |
| -2.819999999999936 | -6.029 | -0.016 | 0.046 | 17.001 | -47.942 |
| -2.816999999999936 | -5.999 | -0.017 | 0.049 | 16.899 | -47.603 |
| -2.813999999999936 | -5.969 | -0.018 | 0.051 | 16.797 | -47.267 |
| -2.810999999999936 | -5.94 | -0.019 | 0.053 | 16.696 | -46.933 |
| -2.807999999999936 | -5.91 | -0.02 | 0.056 | 16.596 | -46.6 |
| -2.804999999999936 | -5.881 | -0.021 | 0.058 | 16.495 | -46.27 |
| -2.801999999999936 | -5.851 | -0.022 | 0.061 | 16.396 | -45.941 |
| -2.798999999999935 | -5.822 | -0.023 | 0.064 | 16.297 | -45.614 |
| -2.795999999999935 | -5.793 | -0.024 | 0.066 | 16.198 | -45.289 |
| -2.792999999999935 | -5.764 | -0.025 | 0.069 | 16.099 | -44.966 |
| -2.789999999999935 | -5.735 | -0.026 | 0.072 | 16.002 | -44.644 |
| -2.786999999999935 | -5.707 | -0.027 | 0.075 | 15.904 | -44.325 |
| -2.783999999999935 | -5.678 | -0.028 | 0.078 | 15.807 | -44.007 |
| -2.780999999999935 | -5.649 | -0.029 | 0.081 | 15.711 | -43.691 |
| -2.777999999999935 | -5.621 | -0.03 | 0.084 | 15.614 | -43.377 |
| -2.774999999999935 | -5.592 | -0.032 | 0.088 | 15.519 | -43.065 |
| -2.771999999999934 | -5.564 | -0.033 | 0.091 | 15.424 | -42.754 |
| -2.768999999999934 | -5.536 | -0.034 | 0.095 | 15.329 | -42.445 |
| -2.765999999999934 | -5.508 | -0.035 | 0.098 | 15.234 | -42.138 |
| -2.762999999999934 | -5.48 | -0.037 | 0.102 | 15.14 | -41.833 |
| -2.759999999999934 | -5.452 | -0.038 | 0.105 | 15.047 | -41.529 |
| -2.756999999999934 | -5.424 | -0.04 | 0.109 | 14.954 | -41.228 |
| -2.753999999999934 | -5.396 | -0.041 | 0.113 | 14.861 | -40.928 |
| -2.750999999999934 | -5.369 | -0.042 | 0.117 | 14.769 | -40.629 |
| -2.747999999999933 | -5.341 | -0.044 | 0.121 | 14.677 | -40.333 |
| -2.744999999999933 | -5.314 | -0.046 | 0.125 | 14.586 | -40.038 |
| -2.741999999999933 | -5.286 | -0.047 | 0.129 | 14.495 | -39.745 |
| -2.738999999999933 | -5.259 | -0.049 | 0.133 | 14.404 | -39.453 |
| -2.735999999999933 | -5.232 | -0.05 | 0.138 | 14.314 | -39.163 |
| -2.732999999999933 | -5.205 | -0.052 | 0.142 | 14.224 | -38.875 |
| -2.729999999999933 | -5.178 | -0.054 | 0.147 | 14.135 | -38.589 |
| -2.726999999999933 | -5.151 | -0.055 | 0.151 | 14.046 | -38.304 |
| -2.723999999999932 | -5.124 | -0.057 | 0.156 | 13.958 | -38.021 |
| -2.720999999999932 | -5.097 | -0.059 | 0.161 | 13.87 | -37.74 |
| -2.717999999999932 | -5.071 | -0.061 | 0.166 | 13.782 | -37.46 |
| -2.714999999999932 | -5.044 | -0.063 | 0.171 | 13.695 | -37.182 |
| -2.711999999999932 | -5.018 | -0.065 | 0.176 | 13.608 | -36.905 |
| -2.708999999999932 | -4.991 | -0.067 | 0.181 | 13.522 | -36.631 |
| -2.705999999999932 | -4.965 | -0.069 | 0.186 | 13.436 | -36.357 |
| -2.702999999999932 | -4.939 | -0.071 | 0.191 | 13.35 | -36.086 |
| -2.699999999999932 | -4.913 | -0.073 | 0.197 | 13.265 | -35.816 |
| -2.696999999999932 | -4.887 | -0.075 | 0.202 | 13.18 | -35.547 |
| -2.693999999999931 | -4.861 | -0.077 | 0.208 | 13.096 | -35.281 |
| -2.690999999999931 | -4.835 | -0.079 | 0.214 | 13.012 | -35.015 |
| -2.687999999999931 | -4.81 | -0.082 | 0.219 | 12.928 | -34.752 |
| -2.684999999999931 | -4.784 | -0.084 | 0.225 | 12.845 | -34.49 |
| -2.681999999999931 | -4.759 | -0.086 | 0.231 | 12.763 | -34.229 |
| -2.678999999999931 | -4.733 | -0.089 | 0.237 | 12.68 | -33.97 |
| -2.675999999999931 | -4.708 | -0.091 | 0.244 | 12.598 | -33.713 |
| -2.672999999999931 | -4.683 | -0.093 | 0.25 | 12.517 | -33.457 |
| -2.669999999999931 | -4.657 | -0.096 | 0.256 | 12.435 | -33.203 |
| -2.66699999999993 | -4.632 | -0.098 | 0.263 | 12.355 | -32.95 |
| -2.66399999999993 | -4.607 | -0.101 | 0.269 | 12.274 | -32.699 |
| -2.66099999999993 | -4.583 | -0.104 | 0.276 | 12.194 | -32.449 |
| -2.65799999999993 | -4.558 | -0.106 | 0.283 | 12.115 | -32.201 |
| -2.65499999999993 | -4.533 | -0.109 | 0.289 | 12.035 | -31.954 |
| -2.65199999999993 | -4.508 | -0.112 | 0.296 | 11.956 | -31.709 |
| -2.64899999999993 | -4.484 | -0.115 | 0.303 | 11.878 | -31.465 |
| -2.64599999999993 | -4.46 | -0.117 | 0.311 | 11.8 | -31.223 |
| -2.64299999999993 | -4.435 | -0.12 | 0.318 | 11.722 | -30.982 |
| -2.639999999999929 | -4.411 | -0.123 | 0.325 | 11.645 | -30.743 |
| -2.636999999999929 | -4.387 | -0.126 | 0.333 | 11.568 | -30.505 |
| -2.633999999999929 | -4.363 | -0.129 | 0.34 | 11.491 | -30.268 |
| -2.630999999999929 | -4.339 | -0.132 | 0.348 | 11.415 | -30.033 |
| -2.627999999999929 | -4.315 | -0.135 | 0.356 | 11.339 | -29.8 |
| -2.624999999999929 | -4.291 | -0.138 | 0.363 | 11.264 | -29.568 |
| -2.621999999999929 | -4.267 | -0.142 | 0.371 | 11.189 | -29.337 |
| -2.618999999999929 | -4.244 | -0.145 | 0.379 | 11.114 | -29.108 |
| -2.615999999999929 | -4.22 | -0.148 | 0.387 | 11.04 | -28.88 |
| -2.612999999999928 | -4.197 | -0.151 | 0.396 | 10.966 | -28.654 |
| -2.609999999999928 | -4.173 | -0.155 | 0.404 | 10.892 | -28.429 |
| -2.606999999999928 | -4.15 | -0.158 | 0.413 | 10.819 | -28.205 |
| -2.603999999999928 | -4.127 | -0.162 | 0.421 | 10.746 | -27.983 |
| -2.600999999999928 | -4.104 | -0.165 | 0.43 | 10.674 | -27.762 |
| -2.597999999999928 | -4.081 | -0.169 | 0.438 | 10.602 | -27.543 |
| -2.594999999999928 | -4.058 | -0.172 | 0.447 | 10.53 | -27.325 |
| -2.591999999999928 | -4.035 | -0.176 | 0.456 | 10.458 | -27.108 |
| -2.588999999999928 | -4.012 | -0.18 | 0.465 | 10.387 | -26.893 |
| -2.585999999999927 | -3.989 | -0.183 | 0.475 | 10.317 | -26.679 |
| -2.582999999999927 | -3.967 | -0.187 | 0.484 | 10.246 | -26.466 |
| -2.579999999999927 | -3.944 | -0.191 | 0.493 | 10.176 | -26.255 |
| -2.576999999999927 | -3.922 | -0.195 | 0.503 | 10.107 | -26.045 |
| -2.573999999999927 | -3.9 | -0.199 | 0.512 | 10.037 | -25.836 |
| -2.570999999999927 | -3.877 | -0.203 | 0.522 | 9.969 | -25.629 |
| -2.567999999999927 | -3.855 | -0.207 | 0.532 | 9.9 | -25.423 |
| -2.564999999999927 | -3.833 | -0.211 | 0.542 | 9.832 | -25.218 |
| -2.561999999999927 | -3.811 | -0.215 | 0.552 | 9.764 | -25.015 |
| -2.558999999999926 | -3.789 | -0.219 | 0.562 | 9.696 | -24.813 |
| -2.555999999999926 | -3.767 | -0.224 | 0.572 | 9.629 | -24.612 |
| -2.552999999999926 | -3.746 | -0.228 | 0.582 | 9.562 | -24.413 |
| -2.549999999999926 | -3.724 | -0.232 | 0.593 | 9.496 | -24.214 |
| -2.546999999999926 | -3.702 | -0.237 | 0.603 | 9.43 | -24.018 |
| -2.543999999999926 | -3.681 | -0.241 | 0.614 | 9.364 | -23.822 |
| -2.540999999999926 | -3.659 | -0.246 | 0.624 | 9.298 | -23.627 |
| -2.537999999999926 | -3.638 | -0.25 | 0.635 | 9.233 | -23.434 |
| -2.534999999999926 | -3.617 | -0.255 | 0.646 | 9.169 | -23.242 |
| -2.531999999999925 | -3.596 | -0.26 | 0.657 | 9.104 | -23.052 |
| -2.528999999999925 | -3.575 | -0.264 | 0.668 | 9.04 | -22.862 |
| -2.525999999999925 | -3.554 | -0.269 | 0.68 | 8.976 | -22.674 |
| -2.522999999999925 | -3.533 | -0.274 | 0.691 | 8.913 | -22.487 |
| -2.519999999999925 | -3.512 | -0.279 | 0.702 | 8.85 | -22.301 |
| -2.516999999999925 | -3.491 | -0.284 | 0.714 | 8.787 | -22.117 |
| -2.513999999999925 | -3.47 | -0.289 | 0.726 | 8.725 | -21.934 |
| -2.510999999999925 | -3.45 | -0.294 | 0.737 | 8.662 | -21.751 |
| -2.507999999999925 | -3.429 | -0.299 | 0.749 | 8.601 | -21.57 |
| -2.504999999999924 | -3.409 | -0.304 | 0.761 | 8.539 | -21.391 |
| -2.501999999999924 | -3.389 | -0.309 | 0.773 | 8.478 | -21.212 |
| -2.498999999999924 | -3.368 | -0.314 | 0.785 | 8.417 | -21.035 |
| -2.495999999999924 | -3.348 | -0.32 | 0.798 | 8.357 | -20.859 |
| -2.492999999999924 | -3.328 | -0.325 | 0.81 | 8.297 | -20.683 |
| -2.489999999999924 | -3.308 | -0.33 | 0.822 | 8.237 | -20.51 |
| -2.486999999999924 | -3.288 | -0.336 | 0.835 | 8.177 | -20.337 |
| -2.483999999999924 | -3.268 | -0.341 | 0.848 | 8.118 | -20.165 |
| -2.480999999999923 | -3.248 | -0.347 | 0.861 | 8.059 | -19.995 |
| -2.477999999999923 | -3.229 | -0.352 | 0.873 | 8.001 | -19.826 |
| -2.474999999999923 | -3.209 | -0.358 | 0.886 | 7.942 | -19.657 |
| -2.471999999999923 | -3.19 | -0.364 | 0.899 | 7.884 | -19.49 |
| -2.468999999999923 | -3.17 | -0.37 | 0.913 | 7.827 | -19.324 |
| -2.465999999999923 | -3.151 | -0.376 | 0.926 | 7.77 | -19.16 |
| -2.462999999999923 | -3.131 | -0.381 | 0.939 | 7.713 | -18.996 |
| -2.459999999999923 | -3.112 | -0.387 | 0.953 | 7.656 | -18.833 |
| -2.456999999999923 | -3.093 | -0.393 | 0.967 | 7.599 | -18.672 |
| -2.453999999999922 | -3.074 | -0.399 | 0.98 | 7.543 | -18.512 |
| -2.450999999999922 | -3.055 | -0.406 | 0.994 | 7.488 | -18.352 |
| -2.447999999999922 | -3.036 | -0.412 | 1.008 | 7.432 | -18.194 |
| -2.444999999999922 | -3.017 | -0.418 | 1.022 | 7.377 | -18.037 |
| -2.441999999999922 | -2.998 | -0.424 | 1.036 | 7.322 | -17.881 |
| -2.438999999999922 | -2.98 | -0.431 | 1.05 | 7.268 | -17.726 |
| -2.435999999999922 | -2.961 | -0.437 | 1.065 | 7.213 | -17.572 |
| -2.432999999999922 | -2.943 | -0.443 | 1.079 | 7.159 | -17.419 |
| -2.429999999999922 | -2.924 | -0.45 | 1.094 | 7.106 | -17.267 |
| -2.426999999999921 | -2.906 | -0.457 | 1.108 | 7.052 | -17.116 |
| -2.423999999999921 | -2.888 | -0.463 | 1.123 | 6.999 | -16.967 |
| -2.420999999999921 | -2.869 | -0.47 | 1.138 | 6.947 | -16.818 |
| -2.417999999999921 | -2.851 | -0.477 | 1.153 | 6.894 | -16.67 |
| -2.414999999999921 | -2.833 | -0.483 | 1.168 | 6.842 | -16.524 |
| -2.411999999999921 | -2.815 | -0.49 | 1.183 | 6.79 | -16.378 |
| -2.408999999999921 | -2.797 | -0.497 | 1.198 | 6.739 | -16.233 |
| -2.405999999999921 | -2.779 | -0.504 | 1.213 | 6.687 | -16.09 |
| -2.402999999999921 | -2.762 | -0.511 | 1.229 | 6.636 | -15.947 |
| -2.39999999999992 | -2.744 | -0.518 | 1.244 | 6.586 | -15.805 |
| -2.39699999999992 | -2.726 | -0.526 | 1.26 | 6.535 | -15.665 |
| -2.39399999999992 | -2.709 | -0.533 | 1.275 | 6.485 | -15.525 |
| -2.39099999999992 | -2.691 | -0.54 | 1.291 | 6.435 | -15.387 |
| -2.38799999999992 | -2.674 | -0.547 | 1.307 | 6.386 | -15.249 |
| -2.38499999999992 | -2.657 | -0.555 | 1.323 | 6.336 | -15.112 |
| -2.38199999999992 | -2.64 | -0.562 | 1.339 | 6.287 | -14.976 |
| -2.37899999999992 | -2.622 | -0.57 | 1.355 | 6.239 | -14.842 |
| -2.375999999999919 | -2.605 | -0.577 | 1.372 | 6.19 | -14.708 |
| -2.372999999999919 | -2.588 | -0.585 | 1.388 | 6.142 | -14.575 |
| -2.369999999999919 | -2.571 | -0.593 | 1.404 | 6.094 | -14.443 |
| -2.366999999999919 | -2.554 | -0.6 | 1.421 | 6.046 | -14.312 |
| -2.363999999999919 | -2.538 | -0.608 | 1.438 | 5.999 | -14.182 |
| -2.360999999999919 | -2.521 | -0.616 | 1.454 | 5.952 | -14.053 |
| -2.357999999999919 | -2.504 | -0.624 | 1.471 | 5.905 | -13.925 |
| -2.354999999999919 | -2.488 | -0.632 | 1.488 | 5.859 | -13.797 |
| -2.351999999999919 | -2.471 | -0.64 | 1.505 | 5.813 | -13.671 |
| -2.348999999999918 | -2.455 | -0.648 | 1.522 | 5.767 | -13.546 |
| -2.345999999999918 | -2.439 | -0.656 | 1.54 | 5.721 | -13.421 |
| -2.342999999999918 | -2.422 | -0.664 | 1.557 | 5.675 | -13.298 |
| -2.339999999999918 | -2.406 | -0.673 | 1.574 | 5.63 | -13.175 |
| -2.336999999999918 | -2.39 | -0.681 | 1.592 | 5.585 | -13.053 |
| -2.333999999999918 | -2.374 | -0.689 | 1.609 | 5.541 | -12.932 |
| -2.330999999999918 | -2.358 | -0.698 | 1.627 | 5.496 | -12.812 |
| -2.327999999999918 | -2.342 | -0.706 | 1.645 | 5.452 | -12.693 |
| -2.324999999999918 | -2.326 | -0.715 | 1.662 | 5.408 | -12.575 |
| -2.321999999999917 | -2.31 | -0.724 | 1.68 | 5.365 | -12.457 |
| -2.318999999999917 | -2.295 | -0.732 | 1.698 | 5.322 | -12.341 |
| -2.315999999999917 | -2.279 | -0.741 | 1.717 | 5.278 | -12.225 |
| -2.312999999999917 | -2.264 | -0.75 | 1.735 | 5.236 | -12.11 |
| -2.309999999999917 | -2.248 | -0.759 | 1.753 | 5.193 | -11.996 |
| -2.306999999999917 | -2.233 | -0.768 | 1.771 | 5.151 | -11.883 |
| -2.303999999999917 | -2.217 | -0.777 | 1.79 | 5.109 | -11.771 |
| -2.300999999999917 | -2.202 | -0.786 | 1.808 | 5.067 | -11.659 |
| -2.297999999999916 | -2.187 | -0.795 | 1.827 | 5.025 | -11.548 |
| -2.294999999999916 | -2.172 | -0.804 | 1.846 | 4.984 | -11.439 |
| -2.291999999999916 | -2.157 | -0.813 | 1.864 | 4.943 | -11.33 |
| -2.288999999999916 | -2.142 | -0.823 | 1.883 | 4.902 | -11.221 |
| -2.285999999999916 | -2.127 | -0.832 | 1.902 | 4.862 | -11.114 |
| -2.282999999999916 | -2.112 | -0.842 | 1.921 | 4.822 | -11.008 |
| -2.279999999999916 | -2.097 | -0.851 | 1.94 | 4.782 | -10.902 |
| -2.276999999999916 | -2.082 | -0.861 | 1.959 | 4.742 | -10.797 |
| -2.273999999999916 | -2.068 | -0.87 | 1.979 | 4.702 | -10.693 |
| -2.270999999999916 | -2.053 | -0.88 | 1.998 | 4.663 | -10.589 |
| -2.267999999999915 | -2.039 | -0.89 | 2.018 | 4.624 | -10.487 |
| -2.264999999999915 | -2.024 | -0.899 | 2.037 | 4.585 | -10.385 |
| -2.261999999999915 | -2.01 | -0.909 | 2.057 | 4.546 | -10.284 |
| -2.258999999999915 | -1.996 | -0.919 | 2.076 | 4.508 | -10.184 |
| -2.255999999999915 | -1.981 | -0.929 | 2.096 | 4.47 | -10.084 |
| -2.252999999999915 | -1.967 | -0.939 | 2.116 | 4.432 | -9.986 |
| -2.249999999999915 | -1.953 | -0.949 | 2.136 | 4.395 | -9.888 |
| -2.246999999999915 | -1.939 | -0.959 | 2.156 | 4.357 | -9.791 |
| -2.243999999999914 | -1.925 | -0.97 | 2.176 | 4.32 | -9.694 |
| -2.240999999999914 | -1.911 | -0.98 | 2.196 | 4.283 | -9.598 |
| -2.237999999999914 | -1.897 | -0.99 | 2.216 | 4.246 | -9.503 |
| -2.234999999999914 | -1.884 | -1.001 | 2.236 | 4.21 | -9.409 |
| -2.231999999999914 | -1.87 | -1.011 | 2.257 | 4.174 | -9.316 |
| -2.228999999999914 | -1.856 | -1.022 | 2.277 | 4.138 | -9.223 |
| -2.225999999999914 | -1.843 | -1.032 | 2.298 | 4.102 | -9.131 |
| -2.222999999999914 | -1.829 | -1.043 | 2.318 | 4.066 | -9.04 |
| -2.219999999999914 | -1.816 | -1.054 | 2.339 | 4.031 | -8.949 |
| -2.216999999999913 | -1.802 | -1.064 | 2.359 | 3.996 | -8.859 |
| -2.213999999999913 | -1.789 | -1.075 | 2.38 | 3.961 | -8.77 |
| -2.210999999999913 | -1.776 | -1.086 | 2.401 | 3.927 | -8.682 |
| -2.207999999999913 | -1.763 | -1.097 | 2.422 | 3.892 | -8.594 |
| -2.204999999999913 | -1.75 | -1.108 | 2.443 | 3.858 | -8.507 |
| -2.201999999999913 | -1.737 | -1.119 | 2.464 | 3.824 | -8.421 |
| -2.198999999999913 | -1.724 | -1.13 | 2.485 | 3.79 | -8.335 |
| -2.195999999999913 | -1.711 | -1.141 | 2.506 | 3.757 | -8.25 |
| -2.192999999999913 | -1.698 | -1.153 | 2.528 | 3.724 | -8.166 |
| -2.189999999999912 | -1.685 | -1.164 | 2.549 | 3.69 | -8.082 |
| -2.186999999999912 | -1.672 | -1.175 | 2.57 | 3.658 | -7.999 |
| -2.183999999999912 | -1.66 | -1.187 | 2.592 | 3.625 | -7.917 |
| -2.180999999999912 | -1.647 | -1.198 | 2.613 | 3.593 | -7.835 |
| -2.177999999999912 | -1.635 | -1.21 | 2.635 | 3.56 | -7.754 |
| -2.174999999999912 | -1.622 | -1.221 | 2.656 | 3.528 | -7.674 |
| -2.171999999999912 | -1.61 | -1.233 | 2.678 | 3.497 | -7.595 |
| -2.168999999999912 | -1.598 | -1.245 | 2.7 | 3.465 | -7.516 |
| -2.165999999999912 | -1.585 | -1.256 | 2.722 | 3.434 | -7.437 |
| -2.162999999999911 | -1.573 | -1.268 | 2.743 | 3.402 | -7.36 |
| -2.159999999999911 | -1.561 | -1.28 | 2.765 | 3.372 | -7.283 |
| -2.156999999999911 | -1.549 | -1.292 | 2.787 | 3.341 | -7.206 |
| -2.153999999999911 | -1.537 | -1.304 | 2.809 | 3.31 | -7.13 |
| -2.150999999999911 | -1.525 | -1.316 | 2.831 | 3.28 | -7.055 |
| -2.147999999999911 | -1.513 | -1.328 | 2.854 | 3.25 | -6.981 |
| -2.144999999999911 | -1.501 | -1.341 | 2.876 | 3.22 | -6.907 |
| -2.141999999999911 | -1.489 | -1.353 | 2.898 | 3.19 | -6.833 |
| -2.138999999999911 | -1.478 | -1.365 | 2.92 | 3.161 | -6.761 |
| -2.13599999999991 | -1.466 | -1.378 | 2.943 | 3.131 | -6.689 |
| -2.13299999999991 | -1.454 | -1.39 | 2.965 | 3.102 | -6.617 |
| -2.12999999999991 | -1.443 | -1.403 | 2.988 | 3.073 | -6.546 |
| -2.12699999999991 | -1.431 | -1.415 | 3.01 | 3.045 | -6.476 |
| -2.12399999999991 | -1.42 | -1.428 | 3.033 | 3.016 | -6.406 |
| -2.12099999999991 | -1.409 | -1.44 | 3.055 | 2.988 | -6.337 |
| -2.11799999999991 | -1.397 | -1.453 | 3.078 | 2.96 | -6.269 |
| -2.11499999999991 | -1.386 | -1.466 | 3.101 | 2.932 | -6.201 |
| -2.111999999999909 | -1.375 | -1.479 | 3.123 | 2.904 | -6.133 |
| -2.108999999999909 | -1.364 | -1.492 | 3.146 | 2.877 | -6.067 |
| -2.105999999999909 | -1.353 | -1.505 | 3.169 | 2.849 | -6 |
| -2.102999999999909 | -1.342 | -1.518 | 3.192 | 2.822 | -5.935 |
| -2.099999999999909 | -1.331 | -1.531 | 3.215 | 2.795 | -5.87 |
| -2.096999999999909 | -1.32 | -1.544 | 3.238 | 2.768 | -5.805 |
| -2.093999999999909 | -1.309 | -1.557 | 3.261 | 2.742 | -5.741 |
| -2.090999999999909 | -1.299 | -1.571 | 3.284 | 2.715 | -5.678 |
| -2.087999999999909 | -1.288 | -1.584 | 3.307 | 2.689 | -5.615 |
| -2.084999999999908 | -1.277 | -1.597 | 3.33 | 2.663 | -5.553 |
| -2.081999999999908 | -1.267 | -1.611 | 3.353 | 2.637 | -5.491 |
| -2.078999999999908 | -1.256 | -1.624 | 3.377 | 2.612 | -5.43 |
| -2.075999999999908 | -1.246 | -1.638 | 3.4 | 2.586 | -5.369 |
| -2.072999999999908 | -1.235 | -1.651 | 3.423 | 2.561 | -5.309 |
| -2.069999999999908 | -1.225 | -1.665 | 3.447 | 2.536 | -5.249 |
| -2.066999999999908 | -1.215 | -1.679 | 3.47 | 2.511 | -5.19 |
| -2.063999999999908 | -1.205 | -1.693 | 3.493 | 2.486 | -5.131 |
| -2.060999999999908 | -1.194 | -1.706 | 3.517 | 2.462 | -5.073 |
| -2.057999999999907 | -1.184 | -1.72 | 3.54 | 2.437 | -5.016 |
| -2.054999999999907 | -1.174 | -1.734 | 3.564 | 2.413 | -4.959 |
| -2.051999999999907 | -1.164 | -1.748 | 3.587 | 2.389 | -4.902 |
| -2.048999999999907 | -1.154 | -1.762 | 3.611 | 2.365 | -4.846 |
| -2.045999999999907 | -1.144 | -1.776 | 3.635 | 2.342 | -4.791 |
| -2.042999999999907 | -1.135 | -1.791 | 3.658 | 2.318 | -4.736 |
| -2.039999999999907 | -1.125 | -1.805 | 3.682 | 2.295 | -4.681 |
| -2.036999999999907 | -1.115 | -1.819 | 3.706 | 2.272 | -4.627 |
| -2.033999999999907 | -1.106 | -1.834 | 3.729 | 2.249 | -4.574 |
| -2.030999999999906 | -1.096 | -1.848 | 3.753 | 2.226 | -4.521 |
| -2.027999999999906 | -1.086 | -1.862 | 3.777 | 2.203 | -4.468 |
| -2.024999999999906 | -1.077 | -1.877 | 3.801 | 2.181 | -4.416 |
| -2.021999999999906 | -1.067 | -1.891 | 3.825 | 2.158 | -4.364 |
| -2.018999999999906 | -1.058 | -1.906 | 3.848 | 2.136 | -4.313 |
| -2.015999999999906 | -1.049 | -1.921 | 3.872 | 2.114 | -4.262 |
| -2.012999999999906 | -1.04 | -1.936 | 3.896 | 2.093 | -4.212 |
| -2.009999999999906 | -1.03 | -1.95 | 3.92 | 2.071 | -4.163 |
| -2.006999999999906 | -1.021 | -1.965 | 3.944 | 2.049 | -4.113 |
| -2.003999999999905 | -1.012 | -1.98 | 3.968 | 2.028 | -4.064 |
| -2.000999999999905 | -1.003 | -1.995 | 3.992 | 2.007 | -4.016 |
| -1.997999999999905 | -0.994 | -2.01 | 4.016 | 1.986 | -3.968 |
| -1.994999999999905 | -0.985 | -2.025 | 4.04 | 1.965 | -3.921 |
| -1.991999999999906 | -0.976 | -2.04 | 4.064 | 1.945 | -3.874 |
| -1.988999999999906 | -0.967 | -2.055 | 4.088 | 1.924 | -3.827 |
| -1.985999999999906 | -0.959 | -2.071 | 4.112 | 1.904 | -3.781 |
| -1.982999999999906 | -0.95 | -2.086 | 4.136 | 1.884 | -3.735 |
| -1.979999999999906 | -0.941 | -2.101 | 4.16 | 1.864 | -3.69 |
| -1.976999999999906 | -0.933 | -2.117 | 4.184 | 1.844 | -3.645 |
| -1.973999999999906 | -0.924 | -2.132 | 4.209 | 1.824 | -3.601 |
| -1.970999999999906 | -0.915 | -2.147 | 4.233 | 1.804 | -3.557 |
| -1.967999999999906 | -0.907 | -2.163 | 4.257 | 1.785 | -3.513 |
| -1.964999999999907 | -0.899 | -2.179 | 4.281 | 1.766 | -3.47 |
| -1.961999999999907 | -0.89 | -2.194 | 4.305 | 1.747 | -3.427 |
| -1.958999999999907 | -0.882 | -2.21 | 4.329 | 1.728 | -3.385 |
| -1.955999999999907 | -0.874 | -2.226 | 4.354 | 1.709 | -3.343 |
| -1.952999999999907 | -0.866 | -2.242 | 4.378 | 1.69 | -3.301 |
| -1.949999999999907 | -0.857 | -2.257 | 4.402 | 1.672 | -3.26 |
| -1.946999999999907 | -0.849 | -2.273 | 4.426 | 1.654 | -3.219 |
| -1.943999999999907 | -0.841 | -2.289 | 4.45 | 1.635 | -3.179 |
| -1.940999999999907 | -0.833 | -2.305 | 4.474 | 1.617 | -3.139 |
| -1.937999999999908 | -0.825 | -2.321 | 4.499 | 1.599 | -3.1 |
| -1.934999999999908 | -0.817 | -2.337 | 4.523 | 1.582 | -3.061 |
| -1.931999999999908 | -0.81 | -2.354 | 4.547 | 1.564 | -3.022 |
| -1.928999999999908 | -0.802 | -2.37 | 4.571 | 1.547 | -2.983 |
| -1.925999999999908 | -0.794 | -2.386 | 4.595 | 1.529 | -2.945 |
| -1.922999999999908 | -0.786 | -2.402 | 4.62 | 1.512 | -2.908 |
| -1.919999999999908 | -0.779 | -2.419 | 4.644 | 1.495 | -2.871 |
| -1.916999999999908 | -0.771 | -2.435 | 4.668 | 1.478 | -2.834 |
| -1.913999999999908 | -0.764 | -2.451 | 4.692 | 1.461 | -2.797 |
| -1.910999999999909 | -0.756 | -2.468 | 4.716 | 1.445 | -2.761 |
| -1.907999999999909 | -0.749 | -2.485 | 4.741 | 1.428 | -2.725 |
| -1.904999999999909 | -0.741 | -2.501 | 4.765 | 1.412 | -2.69 |
| -1.901999999999909 | -0.734 | -2.518 | 4.789 | 1.396 | -2.655 |
| -1.898999999999909 | -0.727 | -2.534 | 4.813 | 1.38 | -2.62 |
| -1.895999999999909 | -0.719 | -2.551 | 4.837 | 1.364 | -2.586 |
| -1.892999999999909 | -0.712 | -2.568 | 4.861 | 1.348 | -2.552 |
| -1.889999999999909 | -0.705 | -2.585 | 4.885 | 1.332 | -2.518 |
| -1.886999999999909 | -0.698 | -2.602 | 4.909 | 1.317 | -2.485 |
| -1.883999999999909 | -0.691 | -2.619 | 4.933 | 1.301 | -2.452 |
| -1.88099999999991 | -0.684 | -2.636 | 4.958 | 1.286 | -2.419 |
| -1.87799999999991 | -0.677 | -2.653 | 4.982 | 1.271 | -2.387 |
| -1.87499999999991 | -0.67 | -2.67 | 5.006 | 1.256 | -2.355 |
| -1.87199999999991 | -0.663 | -2.687 | 5.03 | 1.241 | -2.324 |
| -1.86899999999991 | -0.656 | -2.704 | 5.054 | 1.227 | -2.292 |
| -1.86599999999991 | -0.649 | -2.721 | 5.078 | 1.212 | -2.261 |
| -1.86299999999991 | -0.643 | -2.738 | 5.102 | 1.197 | -2.231 |
| -1.85999999999991 | -0.636 | -2.756 | 5.126 | 1.183 | -2.2 |
| -1.85699999999991 | -0.629 | -2.773 | 5.149 | 1.169 | -2.171 |
| -1.853999999999911 | -0.623 | -2.79 | 5.173 | 1.155 | -2.141 |
| -1.850999999999911 | -0.616 | -2.808 | 5.197 | 1.141 | -2.112 |
| -1.847999999999911 | -0.61 | -2.825 | 5.221 | 1.127 | -2.083 |
| -1.844999999999911 | -0.603 | -2.843 | 5.245 | 1.113 | -2.054 |
| -1.841999999999911 | -0.597 | -2.86 | 5.269 | 1.1 | -2.025 |
| -1.838999999999911 | -0.591 | -2.878 | 5.292 | 1.086 | -1.997 |
| -1.835999999999911 | -0.584 | -2.896 | 5.316 | 1.073 | -1.97 |
| -1.832999999999911 | -0.578 | -2.913 | 5.34 | 1.059 | -1.942 |
| -1.829999999999911 | -0.572 | -2.931 | 5.364 | 1.046 | -1.915 |
| -1.826999999999912 | -0.566 | -2.949 | 5.387 | 1.033 | -1.888 |
| -1.823999999999912 | -0.559 | -2.967 | 5.411 | 1.02 | -1.861 |
| -1.820999999999912 | -0.553 | -2.984 | 5.435 | 1.008 | -1.835 |
| -1.817999999999912 | -0.547 | -3.002 | 5.458 | 0.995 | -1.809 |
| -1.814999999999912 | -0.541 | -3.02 | 5.482 | 0.983 | -1.783 |
| -1.811999999999912 | -0.535 | -3.038 | 5.505 | 0.97 | -1.758 |
| -1.808999999999912 | -0.529 | -3.056 | 5.529 | 0.958 | -1.733 |
| -1.805999999999912 | -0.524 | -3.074 | 5.552 | 0.946 | -1.708 |
| -1.802999999999912 | -0.518 | -3.092 | 5.575 | 0.934 | -1.683 |
| -1.799999999999912 | -0.512 | -3.11 | 5.599 | 0.922 | -1.659 |
| -1.796999999999913 | -0.506 | -3.129 | 5.622 | 0.91 | -1.635 |
| -1.793999999999913 | -0.501 | -3.147 | 5.645 | 0.898 | -1.611 |
| -1.790999999999913 | -0.495 | -3.165 | 5.669 | 0.886 | -1.588 |
| -1.787999999999913 | -0.489 | -3.183 | 5.692 | 0.875 | -1.564 |
| -1.784999999999913 | -0.484 | -3.202 | 5.715 | 0.863 | -1.541 |
| -1.781999999999913 | -0.478 | -3.22 | 5.738 | 0.852 | -1.519 |
| -1.778999999999913 | -0.473 | -3.238 | 5.761 | 0.841 | -1.496 |
| -1.775999999999913 | -0.467 | -3.257 | 5.784 | 0.83 | -1.474 |
| -1.772999999999913 | -0.462 | -3.275 | 5.807 | 0.819 | -1.452 |
| -1.769999999999914 | -0.457 | -3.294 | 5.83 | 0.808 | -1.43 |
| -1.766999999999914 | -0.451 | -3.312 | 5.853 | 0.797 | -1.409 |
| -1.763999999999914 | -0.446 | -3.331 | 5.876 | 0.787 | -1.388 |
| -1.760999999999914 | -0.441 | -3.349 | 5.898 | 0.776 | -1.367 |
| -1.757999999999914 | -0.436 | -3.368 | 5.921 | 0.766 | -1.346 |
| -1.754999999999914 | -0.43 | -3.387 | 5.944 | 0.755 | -1.326 |
| -1.751999999999914 | -0.425 | -3.405 | 5.966 | 0.745 | -1.305 |
| -1.748999999999914 | -0.42 | -3.424 | 5.989 | 0.735 | -1.285 |
| -1.745999999999914 | -0.415 | -3.443 | 6.011 | 0.725 | -1.266 |
| -1.742999999999915 | -0.41 | -3.462 | 6.034 | 0.715 | -1.246 |
| -1.739999999999915 | -0.405 | -3.481 | 6.056 | 0.705 | -1.227 |
| -1.736999999999915 | -0.4 | -3.5 | 6.079 | 0.695 | -1.208 |
| -1.733999999999915 | -0.395 | -3.518 | 6.101 | 0.686 | -1.189 |
| -1.730999999999915 | -0.391 | -3.537 | 6.123 | 0.676 | -1.17 |
| -1.727999999999915 | -0.386 | -3.556 | 6.145 | 0.667 | -1.152 |
| -1.724999999999915 | -0.381 | -3.575 | 6.167 | 0.657 | -1.134 |
| -1.721999999999915 | -0.376 | -3.594 | 6.19 | 0.648 | -1.116 |
| -1.718999999999915 | -0.372 | -3.613 | 6.212 | 0.639 | -1.098 |
| -1.715999999999916 | -0.367 | -3.633 | 6.233 | 0.63 | -1.081 |
| -1.712999999999916 | -0.362 | -3.652 | 6.255 | 0.621 | -1.064 |
| -1.709999999999916 | -0.358 | -3.671 | 6.277 | 0.612 | -1.047 |
| -1.706999999999916 | -0.353 | -3.69 | 6.299 | 0.603 | -1.03 |
| -1.703999999999916 | -0.349 | -3.709 | 6.321 | 0.595 | -1.013 |
| -1.700999999999916 | -0.344 | -3.728 | 6.342 | 0.586 | -0.997 |
| -1.697999999999916 | -0.34 | -3.748 | 6.364 | 0.577 | -0.98 |
| -1.694999999999916 | -0.336 | -3.767 | 6.385 | 0.569 | -0.964 |
| -1.691999999999916 | -0.331 | -3.786 | 6.407 | 0.561 | -0.949 |
| -1.688999999999916 | -0.327 | -3.806 | 6.428 | 0.552 | -0.933 |
| -1.685999999999917 | -0.323 | -3.825 | 6.449 | 0.544 | -0.918 |
| -1.682999999999917 | -0.319 | -3.845 | 6.47 | 0.536 | -0.902 |
| -1.679999999999917 | -0.314 | -3.864 | 6.491 | 0.528 | -0.887 |
| -1.676999999999917 | -0.31 | -3.883 | 6.512 | 0.52 | -0.873 |
| -1.673999999999917 | -0.306 | -3.903 | 6.533 | 0.513 | -0.858 |
| -1.670999999999917 | -0.302 | -3.922 | 6.554 | 0.505 | -0.844 |
| -1.667999999999917 | -0.298 | -3.942 | 6.575 | 0.497 | -0.829 |
| -1.664999999999917 | -0.294 | -3.961 | 6.596 | 0.49 | -0.815 |
| -1.661999999999917 | -0.29 | -3.981 | 6.617 | 0.482 | -0.801 |
| -1.658999999999918 | -0.286 | -4.001 | 6.637 | 0.475 | -0.788 |
| -1.655999999999918 | -0.282 | -4.02 | 6.658 | 0.467 | -0.774 |
| -1.652999999999918 | -0.278 | -4.04 | 6.678 | 0.46 | -0.761 |
| -1.649999999999918 | -0.275 | -4.06 | 6.698 | 0.453 | -0.748 |
| -1.646999999999918 | -0.271 | -4.079 | 6.719 | 0.446 | -0.735 |
| -1.643999999999918 | -0.267 | -4.099 | 6.739 | 0.439 | -0.722 |
| -1.640999999999918 | -0.263 | -4.119 | 6.759 | 0.432 | -0.709 |
| -1.637999999999918 | -0.26 | -4.139 | 6.779 | 0.425 | -0.697 |
| -1.634999999999918 | -0.256 | -4.158 | 6.799 | 0.419 | -0.684 |
| -1.631999999999919 | -0.252 | -4.178 | 6.819 | 0.412 | -0.672 |
| -1.628999999999919 | -0.249 | -4.198 | 6.838 | 0.405 | -0.66 |
| -1.625999999999919 | -0.245 | -4.218 | 6.858 | 0.399 | -0.649 |
| -1.622999999999919 | -0.242 | -4.238 | 6.878 | 0.392 | -0.637 |
| -1.619999999999919 | -0.238 | -4.257 | 6.897 | 0.386 | -0.625 |
| -1.616999999999919 | -0.235 | -4.277 | 6.917 | 0.38 | -0.614 |
| -1.613999999999919 | -0.231 | -4.297 | 6.936 | 0.374 | -0.603 |
| -1.610999999999919 | -0.228 | -4.317 | 6.955 | 0.367 | -0.592 |
| -1.607999999999919 | -0.225 | -4.337 | 6.974 | 0.361 | -0.581 |
| -1.60499999999992 | -0.221 | -4.357 | 6.993 | 0.355 | -0.57 |
| -1.60199999999992 | -0.218 | -4.377 | 7.012 | 0.35 | -0.56 |
| -1.59899999999992 | -0.215 | -4.397 | 7.031 | 0.344 | -0.55 |
| -1.59599999999992 | -0.212 | -4.417 | 7.05 | 0.338 | -0.539 |
| -1.59299999999992 | -0.209 | -4.437 | 7.068 | 0.332 | -0.529 |
| -1.58999999999992 | -0.205 | -4.457 | 7.087 | 0.327 | -0.519 |
| -1.58699999999992 | -0.202 | -4.477 | 7.105 | 0.321 | -0.509 |
| -1.58399999999992 | -0.199 | -4.497 | 7.124 | 0.315 | -0.5 |
| -1.58099999999992 | -0.196 | -4.517 | 7.142 | 0.31 | -0.49 |
| -1.577999999999921 | -0.193 | -4.537 | 7.16 | 0.305 | -0.481 |
| -1.574999999999921 | -0.19 | -4.557 | 7.178 | 0.299 | -0.472 |
| -1.571999999999921 | -0.187 | -4.578 | 7.196 | 0.294 | -0.462 |
| -1.568999999999921 | -0.184 | -4.598 | 7.214 | 0.289 | -0.454 |
| -1.565999999999921 | -0.181 | -4.618 | 7.232 | 0.284 | -0.445 |
| -1.562999999999921 | -0.178 | -4.638 | 7.249 | 0.279 | -0.436 |
| -1.559999999999921 | -0.176 | -4.658 | 7.267 | 0.274 | -0.427 |
| -1.556999999999921 | -0.173 | -4.678 | 7.284 | 0.269 | -0.419 |
| -1.553999999999921 | -0.17 | -4.698 | 7.301 | 0.264 | -0.411 |
| -1.550999999999922 | -0.167 | -4.719 | 7.319 | 0.259 | -0.402 |
| -1.547999999999922 | -0.165 | -4.739 | 7.336 | 0.255 | -0.394 |
| -1.544999999999922 | -0.162 | -4.759 | 7.353 | 0.25 | -0.386 |
| -1.541999999999922 | -0.159 | -4.779 | 7.37 | 0.246 | -0.379 |
| -1.538999999999922 | -0.157 | -4.799 | 7.386 | 0.241 | -0.371 |
| -1.535999999999922 | -0.154 | -4.82 | 7.403 | 0.237 | -0.363 |
| -1.532999999999922 | -0.151 | -4.84 | 7.42 | 0.232 | -0.356 |
| -1.529999999999922 | -0.149 | -4.86 | 7.436 | 0.228 | -0.349 |
| -1.526999999999922 | -0.146 | -4.88 | 7.452 | 0.223 | -0.341 |
| -1.523999999999923 | -0.144 | -4.901 | 7.468 | 0.219 | -0.334 |
| -1.520999999999923 | -0.141 | -4.921 | 7.485 | 0.215 | -0.327 |
| -1.517999999999923 | -0.139 | -4.941 | 7.5 | 0.211 | -0.32 |
| -1.514999999999923 | -0.137 | -4.961 | 7.516 | 0.207 | -0.314 |
| -1.511999999999923 | -0.134 | -4.982 | 7.532 | 0.203 | -0.307 |
| -1.508999999999923 | -0.132 | -5.002 | 7.548 | 0.199 | -0.3 |
| -1.505999999999923 | -0.13 | -5.022 | 7.563 | 0.195 | -0.294 |
| -1.502999999999923 | -0.127 | -5.042 | 7.579 | 0.191 | -0.287 |
| -1.499999999999923 | -0.125 | -5.063 | 7.594 | 0.187 | -0.281 |
| -1.496999999999923 | -0.123 | -5.083 | 7.609 | 0.184 | -0.275 |
| -1.493999999999924 | -0.121 | -5.103 | 7.624 | 0.18 | -0.269 |
| -1.490999999999924 | -0.118 | -5.123 | 7.639 | 0.176 | -0.263 |
| -1.487999999999924 | -0.116 | -5.143 | 7.654 | 0.173 | -0.257 |
| -1.484999999999924 | -0.114 | -5.164 | 7.668 | 0.169 | -0.252 |
| -1.481999999999924 | -0.112 | -5.184 | 7.683 | 0.166 | -0.246 |
| -1.478999999999924 | -0.11 | -5.204 | 7.697 | 0.163 | -0.24 |
| -1.475999999999924 | -0.108 | -5.224 | 7.711 | 0.159 | -0.235 |
| -1.472999999999924 | -0.106 | -5.245 | 7.725 | 0.156 | -0.23 |
| -1.469999999999924 | -0.104 | -5.265 | 7.739 | 0.153 | -0.224 |
| -1.466999999999925 | -0.102 | -5.285 | 7.753 | 0.149 | -0.219 |
| -1.463999999999925 | -0.1 | -5.305 | 7.767 | 0.146 | -0.214 |
| -1.460999999999925 | -0.098 | -5.326 | 7.781 | 0.143 | -0.209 |
| -1.457999999999925 | -0.096 | -5.346 | 7.794 | 0.14 | -0.204 |
| -1.454999999999925 | -0.094 | -5.366 | 7.807 | 0.137 | -0.199 |
| -1.451999999999925 | -0.092 | -5.386 | 7.821 | 0.134 | -0.195 |
| -1.448999999999925 | -0.091 | -5.406 | 7.834 | 0.131 | -0.19 |
| -1.445999999999925 | -0.089 | -5.427 | 7.847 | 0.128 | -0.185 |
| -1.442999999999925 | -0.087 | -5.447 | 7.86 | 0.125 | -0.181 |
| -1.439999999999926 | -0.085 | -5.467 | 7.872 | 0.123 | -0.177 |
| -1.436999999999926 | -0.083 | -5.487 | 7.885 | 0.12 | -0.172 |
| -1.433999999999926 | -0.082 | -5.507 | 7.897 | 0.117 | -0.168 |
| -1.430999999999926 | -0.08 | -5.527 | 7.909 | 0.115 | -0.164 |
| -1.427999999999926 | -0.078 | -5.547 | 7.922 | 0.112 | -0.16 |
| -1.424999999999926 | -0.077 | -5.567 | 7.934 | 0.109 | -0.156 |
| -1.421999999999926 | -0.075 | -5.588 | 7.945 | 0.107 | -0.152 |
| -1.418999999999926 | -0.074 | -5.608 | 7.957 | 0.104 | -0.148 |
| -1.415999999999926 | -0.072 | -5.628 | 7.969 | 0.102 | -0.144 |
| -1.412999999999927 | -0.07 | -5.648 | 7.98 | 0.1 | -0.141 |
| -1.409999999999927 | -0.069 | -5.668 | 7.992 | 0.097 | -0.137 |
| -1.406999999999927 | -0.067 | -5.688 | 8.003 | 0.095 | -0.133 |
| -1.403999999999927 | -0.066 | -5.708 | 8.014 | 0.093 | -0.13 |
| -1.400999999999927 | -0.064 | -5.728 | 8.025 | 0.09 | -0.127 |
| -1.397999999999927 | -0.063 | -5.748 | 8.035 | 0.088 | -0.123 |
| -1.394999999999927 | -0.062 | -5.768 | 8.046 | 0.086 | -0.12 |
| -1.391999999999927 | -0.06 | -5.788 | 8.056 | 0.084 | -0.117 |
| -1.388999999999927 | -0.059 | -5.807 | 8.067 | 0.082 | -0.114 |
| -1.385999999999927 | -0.058 | -5.827 | 8.077 | 0.08 | -0.11 |
| -1.382999999999928 | -0.056 | -5.847 | 8.087 | 0.078 | -0.107 |
| -1.379999999999928 | -0.055 | -5.867 | 8.097 | 0.076 | -0.104 |
| -1.376999999999928 | -0.054 | -5.887 | 8.106 | 0.074 | -0.102 |
| -1.373999999999928 | -0.052 | -5.907 | 8.116 | 0.072 | -0.099 |
| -1.370999999999928 | -0.051 | -5.927 | 8.125 | 0.07 | -0.096 |
| -1.367999999999928 | -0.05 | -5.946 | 8.135 | 0.068 | -0.093 |
| -1.364999999999928 | -0.049 | -5.966 | 8.144 | 0.066 | -0.091 |
| -1.361999999999928 | -0.047 | -5.986 | 8.153 | 0.065 | -0.088 |
| -1.358999999999928 | -0.046 | -6.005 | 8.161 | 0.063 | -0.085 |
| -1.355999999999929 | -0.045 | -6.025 | 8.17 | 0.061 | -0.083 |
| -1.352999999999929 | -0.044 | -6.045 | 8.179 | 0.06 | -0.081 |
| -1.349999999999929 | -0.043 | -6.064 | 8.187 | 0.058 | -0.078 |
| -1.346999999999929 | -0.042 | -6.084 | 8.195 | 0.056 | -0.076 |
| -1.343999999999929 | -0.041 | -6.104 | 8.203 | 0.055 | -0.074 |
| -1.340999999999929 | -0.04 | -6.123 | 8.211 | 0.053 | -0.071 |
| -1.337999999999929 | -0.039 | -6.143 | 8.219 | 0.052 | -0.069 |
| -1.334999999999929 | -0.038 | -6.162 | 8.226 | 0.05 | -0.067 |
| -1.331999999999929 | -0.037 | -6.181 | 8.234 | 0.049 | -0.065 |
| -1.32899999999993 | -0.036 | -6.201 | 8.241 | 0.047 | -0.063 |
| -1.32599999999993 | -0.035 | -6.22 | 8.248 | 0.046 | -0.061 |
| -1.32299999999993 | -0.034 | -6.24 | 8.255 | 0.045 | -0.059 |
| -1.31999999999993 | -0.033 | -6.259 | 8.262 | 0.043 | -0.057 |
| -1.31699999999993 | -0.032 | -6.278 | 8.268 | 0.042 | -0.055 |
| -1.31399999999993 | -0.031 | -6.297 | 8.275 | 0.041 | -0.053 |
| -1.31099999999993 | -0.03 | -6.317 | 8.281 | 0.039 | -0.052 |
| -1.30799999999993 | -0.029 | -6.336 | 8.287 | 0.038 | -0.05 |
| -1.30499999999993 | -0.028 | -6.355 | 8.293 | 0.037 | -0.048 |
| -1.301999999999931 | -0.028 | -6.374 | 8.299 | 0.036 | -0.047 |
| -1.298999999999931 | -0.027 | -6.393 | 8.305 | 0.035 | -0.045 |
| -1.295999999999931 | -0.026 | -6.412 | 8.31 | 0.034 | -0.044 |
| -1.292999999999931 | -0.025 | -6.431 | 8.316 | 0.033 | -0.042 |
| -1.289999999999931 | -0.024 | -6.45 | 8.321 | 0.031 | -0.041 |
| -1.286999999999931 | -0.024 | -6.469 | 8.326 | 0.03 | -0.039 |
| -1.283999999999931 | -0.023 | -6.488 | 8.331 | 0.029 | -0.038 |
| -1.280999999999931 | -0.022 | -6.507 | 8.335 | 0.028 | -0.036 |
| -1.277999999999931 | -0.021 | -6.526 | 8.34 | 0.027 | -0.035 |
| -1.274999999999932 | -0.021 | -6.545 | 8.344 | 0.027 | -0.034 |
| -1.271999999999932 | -0.02 | -6.563 | 8.348 | 0.026 | -0.033 |
| -1.268999999999932 | -0.019 | -6.582 | 8.352 | 0.025 | -0.031 |
| -1.265999999999932 | -0.019 | -6.601 | 8.356 | 0.024 | -0.03 |
| -1.262999999999932 | -0.018 | -6.619 | 8.36 | 0.023 | -0.029 |
| -1.259999999999932 | -0.018 | -6.638 | 8.364 | 0.022 | -0.028 |
| -1.256999999999932 | -0.017 | -6.656 | 8.367 | 0.021 | -0.027 |
| -1.253999999999932 | -0.016 | -6.675 | 8.37 | 0.021 | -0.026 |
| -1.250999999999932 | -0.016 | -6.693 | 8.373 | 0.02 | -0.025 |
| -1.247999999999932 | -0.015 | -6.711 | 8.376 | 0.019 | -0.024 |
| -1.244999999999933 | -0.015 | -6.73 | 8.379 | 0.018 | -0.023 |
| -1.241999999999933 | -0.014 | -6.748 | 8.381 | 0.018 | -0.022 |
| -1.238999999999933 | -0.014 | -6.766 | 8.383 | 0.017 | -0.021 |
| -1.235999999999933 | -0.013 | -6.784 | 8.386 | 0.016 | -0.02 |
| -1.232999999999933 | -0.013 | -6.803 | 8.388 | 0.016 | -0.019 |
| -1.229999999999933 | -0.012 | -6.821 | 8.389 | 0.015 | -0.018 |
| -1.226999999999933 | -0.012 | -6.839 | 8.391 | 0.014 | -0.018 |
| -1.223999999999933 | -0.011 | -6.857 | 8.393 | 0.014 | -0.017 |
| -1.220999999999933 | -0.011 | -6.875 | 8.394 | 0.013 | -0.016 |
| -1.217999999999934 | -0.01 | -6.892 | 8.395 | 0.013 | -0.015 |
| -1.214999999999934 | -0.01 | -6.91 | 8.396 | 0.012 | -0.015 |
| -1.211999999999934 | -0.01 | -6.928 | 8.397 | 0.012 | -0.014 |
| -1.208999999999934 | -0.009 | -6.946 | 8.397 | 0.011 | -0.013 |
| -1.205999999999934 | -0.009 | -6.963 | 8.398 | 0.011 | -0.013 |
| -1.202999999999934 | -0.008 | -6.981 | 8.398 | 0.01 | -0.012 |
| -1.199999999999934 | -0.008 | -6.998 | 8.398 | 0.01 | -0.012 |
| -1.196999999999934 | -0.008 | -7.016 | 8.398 | 0.009 | -0.011 |
| -1.193999999999934 | -0.007 | -7.033 | 8.398 | 0.009 | -0.01 |
| -1.190999999999935 | -0.007 | -7.051 | 8.397 | 0.008 | -0.01 |
| -1.187999999999935 | -0.007 | -7.068 | 8.397 | 0.008 | -0.009 |
| -1.184999999999935 | -0.006 | -7.085 | 8.396 | 0.008 | -0.009 |
| -1.181999999999935 | -0.006 | -7.102 | 8.395 | 0.007 | -0.008 |
| -1.178999999999935 | -0.006 | -7.119 | 8.394 | 0.007 | -0.008 |
| -1.175999999999935 | -0.005 | -7.136 | 8.392 | 0.006 | -0.008 |
| -1.172999999999935 | -0.005 | -7.153 | 8.391 | 0.006 | -0.007 |
| -1.169999999999935 | -0.005 | -7.17 | 8.389 | 0.006 | -0.007 |
| -1.166999999999935 | -0.005 | -7.187 | 8.387 | 0.005 | -0.006 |
| -1.163999999999936 | -0.004 | -7.204 | 8.385 | 0.005 | -0.006 |
| -1.160999999999936 | -0.004 | -7.221 | 8.383 | 0.005 | -0.006 |
| -1.157999999999936 | -0.004 | -7.237 | 8.381 | 0.005 | -0.005 |
| -1.154999999999936 | -0.004 | -7.254 | 8.378 | 0.004 | -0.005 |
| -1.151999999999936 | -0.004 | -7.27 | 8.376 | 0.004 | -0.005 |
| -1.148999999999936 | -0.003 | -7.287 | 8.373 | 0.004 | -0.004 |
| -1.145999999999936 | -0.003 | -7.303 | 8.369 | 0.004 | -0.004 |
| -1.142999999999936 | -0.003 | -7.32 | 8.366 | 0.003 | -0.004 |
| -1.139999999999936 | -0.003 | -7.336 | 8.363 | 0.003 | -0.004 |
| -1.136999999999936 | -0.003 | -7.352 | 8.359 | 0.003 | -0.003 |
| -1.133999999999937 | -0.002 | -7.368 | 8.355 | 0.003 | -0.003 |
| -1.130999999999937 | -0.002 | -7.384 | 8.351 | 0.003 | -0.003 |
| -1.127999999999937 | -0.002 | -7.4 | 8.347 | 0.002 | -0.003 |
| -1.124999999999937 | -0.002 | -7.416 | 8.343 | 0.002 | -0.002 |
| -1.121999999999937 | -0.002 | -7.432 | 8.338 | 0.002 | -0.002 |
| -1.118999999999937 | -0.002 | -7.447 | 8.333 | 0.002 | -0.002 |
| -1.115999999999937 | -0.002 | -7.463 | 8.329 | 0.002 | -0.002 |
| -1.112999999999937 | -0.001 | -7.478 | 8.324 | 0.002 | -0.002 |
| -1.109999999999937 | -0.001 | -7.494 | 8.318 | 0.001 | -0.002 |
| -1.106999999999938 | -0.001 | -7.509 | 8.313 | 0.001 | -0.002 |
| -1.103999999999938 | -0.001 | -7.525 | 8.307 | 0.001 | -0.001 |
| -1.100999999999938 | -0.001 | -7.54 | 8.301 | 0.001 | -0.001 |
| -1.097999999999938 | -0.001 | -7.555 | 8.295 | 0.001 | -0.001 |
| -1.094999999999938 | -0.001 | -7.57 | 8.289 | 0.001 | -0.001 |
| -1.091999999999938 | -0.001 | -7.585 | 8.283 | 0.001 | -0.001 |
| -1.088999999999938 | -0.001 | -7.6 | 8.276 | 0.001 | -0.001 |
| -1.085999999999938 | -0.001 | -7.615 | 8.27 | 0.001 | -0.001 |
| -1.082999999999938 | -0.001 | -7.629 | 8.263 | 0.001 | -0.001 |
| -1.079999999999939 | -0.001 | -7.644 | 8.256 | 0.001 | -0.001 |
| -1.076999999999939 | 0 | -7.659 | 8.248 | 0 | -0.001 |
| -1.073999999999939 | 0 | -7.673 | 8.241 | 0 | 0 |
| -1.070999999999939 | 0 | -7.688 | 8.233 | 0 | 0 |
| -1.067999999999939 | 0 | -7.702 | 8.226 | 0 | 0 |
| -1.064999999999939 | 0 | -7.716 | 8.218 | 0 | 0 |
| -1.061999999999939 | 0 | -7.73 | 8.209 | 0 | 0 |
| -1.058999999999939 | 0 | -7.744 | 8.201 | 0 | 0 |
| -1.055999999999939 | 0 | -7.758 | 8.193 | 0 | 0 |
| -1.05299999999994 | 0 | -7.772 | 8.184 | 0 | 0 |
| -1.04999999999994 | 0 | -7.786 | 8.175 | 0 | 0 |
| -1.04699999999994 | 0 | -7.799 | 8.166 | 0 | 0 |
| -1.04399999999994 | 0 | -7.813 | 8.157 | 0 | 0 |
| -1.04099999999994 | 0 | -7.826 | 8.147 | 0 | 0 |
| -1.03799999999994 | 0 | -7.84 | 8.138 | 0 | 0 |
| -1.03499999999994 | 0 | -7.853 | 8.128 | 0 | 0 |
| -1.03199999999994 | 0 | -7.866 | 8.118 | 0 | 0 |
| -1.02899999999994 | 0 | -7.879 | 8.108 | 0 | 0 |
| -1.025999999999941 | 0 | -7.892 | 8.097 | 0 | 0 |
| -1.022999999999941 | 0 | -7.905 | 8.087 | 0 | 0 |
| -1.019999999999941 | 0 | -7.918 | 8.076 | 0 | 0 |
| -1.016999999999941 | 0 | -7.93 | 8.065 | 0 | 0 |
| -1.013999999999941 | 0 | -7.943 | 8.054 | 0 | 0 |
| -1.010999999999941 | 0 | -7.955 | 8.043 | 0 | 0 |
| -1.007999999999941 | 0 | -7.968 | 8.031 | 0 | 0 |
| -1.004999999999941 | 0 | -7.98 | 8.02 | 0 | 0 |
| -1.001999999999941 | 0 | -7.992 | 8.008 | 0 | 0 |
| -0.998999999999941 | 0 | -8.004 | 7.996 | 0 | 0 |
| -0.995999999999941 | 0 | -8.016 | 7.984 | 0 | 0 |
| -0.992999999999941 | 0 | -8.028 | 7.972 | 0 | 0 |
| -0.989999999999941 | 0 | -8.039 | 7.959 | 0 | 0 |
| -0.986999999999941 | 0 | -8.051 | 7.946 | 0 | 0 |
| -0.983999999999941 | 0 | -8.062 | 7.933 | 0 | 0 |
| -0.980999999999941 | 0 | -8.074 | 7.92 | 0 | 0 |
| -0.977999999999941 | 0 | -8.085 | 7.907 | 0 | 0 |
| -0.974999999999941 | 0 | -8.096 | 7.894 | 0 | 0 |
| -0.971999999999941 | 0 | -8.107 | 7.88 | 0 | 0 |
| -0.968999999999941 | 0 | -8.118 | 7.866 | 0 | 0 |
| -0.965999999999941 | 0 | -8.129 | 7.852 | 0 | 0 |
| -0.962999999999941 | 0 | -8.14 | 7.838 | 0 | 0 |
| -0.959999999999941 | 0 | -8.15 | 7.824 | 0 | 0 |
| -0.956999999999941 | 0 | -8.161 | 7.81 | 0 | 0 |
| -0.953999999999941 | 0 | -8.171 | 7.795 | 0 | 0 |
| -0.950999999999941 | 0 | -8.181 | 7.78 | 0 | 0 |
| -0.947999999999941 | 0 | -8.191 | 7.765 | 0 | 0 |
| -0.944999999999941 | 0 | -8.201 | 7.75 | 0 | 0 |
| -0.941999999999941 | 0 | -8.211 | 7.735 | 0 | 0 |
| -0.938999999999941 | 0 | -8.221 | 7.719 | 0 | 0 |
| -0.935999999999941 | 0 | -8.23 | 7.703 | 0 | 0 |
| -0.932999999999941 | 0 | -8.24 | 7.687 | 0 | 0 |
| -0.929999999999941 | 0 | -8.249 | 7.671 | 0 | 0 |
| -0.926999999999941 | 0 | -8.258 | 7.655 | 0 | 0 |
| -0.923999999999941 | 0 | -8.267 | 7.639 | 0 | 0 |
| -0.920999999999941 | 0 | -8.276 | 7.622 | 0 | 0 |
| -0.917999999999941 | 0.001 | -8.285 | 7.605 | -0.001 | 0 |
| -0.914999999999941 | 0.001 | -8.294 | 7.589 | -0.001 | 0.001 |
| -0.911999999999941 | 0.001 | -8.302 | 7.571 | -0.001 | 0.001 |
| -0.908999999999941 | 0.001 | -8.31 | 7.554 | -0.001 | 0.001 |
| -0.905999999999941 | 0.001 | -8.319 | 7.537 | -0.001 | 0.001 |
| -0.902999999999941 | 0.001 | -8.327 | 7.519 | -0.001 | 0.001 |
| -0.899999999999941 | 0.001 | -8.335 | 7.501 | -0.001 | 0.001 |
| -0.896999999999941 | 0.001 | -8.343 | 7.483 | -0.001 | 0.001 |
| -0.893999999999941 | 0.001 | -8.351 | 7.465 | -0.001 | 0.001 |
| -0.890999999999941 | 0.001 | -8.358 | 7.447 | -0.001 | 0.001 |
| -0.887999999999941 | 0.001 | -8.366 | 7.429 | -0.001 | 0.001 |
| -0.884999999999941 | 0.002 | -8.373 | 7.41 | -0.001 | 0.001 |
| -0.881999999999941 | 0.002 | -8.38 | 7.391 | -0.001 | 0.001 |
| -0.878999999999941 | 0.002 | -8.387 | 7.372 | -0.002 | 0.001 |
| -0.875999999999941 | 0.002 | -8.394 | 7.353 | -0.002 | 0.001 |
| -0.872999999999941 | 0.002 | -8.401 | 7.334 | -0.002 | 0.002 |
| -0.869999999999941 | 0.002 | -8.407 | 7.314 | -0.002 | 0.002 |
| -0.866999999999941 | 0.002 | -8.414 | 7.295 | -0.002 | 0.002 |
| -0.863999999999941 | 0.003 | -8.42 | 7.275 | -0.002 | 0.002 |
| -0.860999999999941 | 0.003 | -8.426 | 7.255 | -0.002 | 0.002 |
| -0.857999999999941 | 0.003 | -8.432 | 7.235 | -0.002 | 0.002 |
| -0.854999999999941 | 0.003 | -8.438 | 7.215 | -0.003 | 0.002 |
| -0.851999999999941 | 0.003 | -8.444 | 7.194 | -0.003 | 0.002 |
| -0.848999999999941 | 0.003 | -8.449 | 7.174 | -0.003 | 0.002 |
| -0.845999999999941 | 0.004 | -8.455 | 7.153 | -0.003 | 0.003 |
| -0.842999999999941 | 0.004 | -8.46 | 7.132 | -0.003 | 0.003 |
| -0.839999999999941 | 0.004 | -8.465 | 7.111 | -0.003 | 0.003 |
| -0.836999999999941 | 0.004 | -8.47 | 7.09 | -0.004 | 0.003 |
| -0.833999999999941 | 0.005 | -8.475 | 7.068 | -0.004 | 0.003 |
| -0.830999999999941 | 0.005 | -8.48 | 7.047 | -0.004 | 0.003 |
| -0.827999999999941 | 0.005 | -8.484 | 7.025 | -0.004 | 0.003 |
| -0.824999999999941 | 0.005 | -8.489 | 7.003 | -0.004 | 0.004 |
| -0.821999999999941 | 0.006 | -8.493 | 6.981 | -0.005 | 0.004 |
| -0.818999999999941 | 0.006 | -8.497 | 6.959 | -0.005 | 0.004 |
| -0.815999999999941 | 0.006 | -8.501 | 6.936 | -0.005 | 0.004 |
| -0.812999999999941 | 0.007 | -8.504 | 6.914 | -0.005 | 0.004 |
| -0.809999999999941 | 0.007 | -8.508 | 6.891 | -0.006 | 0.005 |
| -0.806999999999941 | 0.007 | -8.511 | 6.869 | -0.006 | 0.005 |
| -0.803999999999941 | 0.008 | -8.514 | 6.846 | -0.006 | 0.005 |
| -0.800999999999941 | 0.008 | -8.517 | 6.822 | -0.006 | 0.005 |
| -0.797999999999941 | 0.008 | -8.52 | 6.799 | -0.007 | 0.005 |
| -0.794999999999941 | 0.009 | -8.523 | 6.776 | -0.007 | 0.005 |
| -0.791999999999941 | 0.009 | -8.526 | 6.752 | -0.007 | 0.006 |
| -0.788999999999941 | 0.009 | -8.528 | 6.729 | -0.007 | 0.006 |
| -0.785999999999941 | 0.01 | -8.53 | 6.705 | -0.008 | 0.006 |
| -0.782999999999941 | 0.01 | -8.532 | 6.681 | -0.008 | 0.006 |
| -0.779999999999941 | 0.011 | -8.534 | 6.657 | -0.008 | 0.006 |
| -0.776999999999941 | 0.011 | -8.536 | 6.632 | -0.009 | 0.007 |
| -0.773999999999941 | 0.012 | -8.537 | 6.608 | -0.009 | 0.007 |
| -0.770999999999941 | 0.012 | -8.539 | 6.583 | -0.009 | 0.007 |
| -0.767999999999941 | 0.012 | -8.54 | 6.559 | -0.01 | 0.007 |
| -0.764999999999941 | 0.013 | -8.541 | 6.534 | -0.01 | 0.008 |
| -0.761999999999941 | 0.013 | -8.542 | 6.509 | -0.01 | 0.008 |
| -0.758999999999941 | 0.014 | -8.542 | 6.483 | -0.011 | 0.008 |
| -0.755999999999941 | 0.015 | -8.543 | 6.458 | -0.011 | 0.008 |
| -0.752999999999941 | 0.015 | -8.543 | 6.433 | -0.011 | 0.009 |
| -0.749999999999941 | 0.016 | -8.543 | 6.407 | -0.012 | 0.009 |
| -0.746999999999941 | 0.016 | -8.543 | 6.382 | -0.012 | 0.009 |
| -0.743999999999941 | 0.017 | -8.543 | 6.356 | -0.012 | 0.009 |
| -0.740999999999941 | 0.017 | -8.542 | 6.33 | -0.013 | 0.01 |
| -0.737999999999941 | 0.018 | -8.542 | 6.304 | -0.013 | 0.01 |
| -0.734999999999941 | 0.019 | -8.541 | 6.277 | -0.014 | 0.01 |
| -0.731999999999941 | 0.019 | -8.54 | 6.251 | -0.014 | 0.01 |
| -0.728999999999941 | 0.02 | -8.538 | 6.225 | -0.015 | 0.011 |
| -0.725999999999941 | 0.021 | -8.537 | 6.198 | -0.015 | 0.011 |
| -0.722999999999941 | 0.021 | -8.535 | 6.171 | -0.015 | 0.011 |
| -0.719999999999941 | 0.022 | -8.534 | 6.144 | -0.016 | 0.011 |
| -0.716999999999941 | 0.023 | -8.532 | 6.117 | -0.016 | 0.012 |
| -0.713999999999941 | 0.023 | -8.53 | 6.09 | -0.017 | 0.012 |
| -0.710999999999941 | 0.024 | -8.527 | 6.063 | -0.017 | 0.012 |
| -0.707999999999941 | 0.025 | -8.525 | 6.035 | -0.018 | 0.012 |
| -0.704999999999941 | 0.026 | -8.522 | 6.008 | -0.018 | 0.013 |
| -0.701999999999941 | 0.026 | -8.519 | 5.98 | -0.019 | 0.013 |
| -0.698999999999941 | 0.027 | -8.516 | 5.953 | -0.019 | 0.013 |
| -0.695999999999941 | 0.028 | -8.512 | 5.925 | -0.02 | 0.014 |
| -0.692999999999941 | 0.029 | -8.509 | 5.897 | -0.02 | 0.014 |
| -0.689999999999941 | 0.03 | -8.505 | 5.869 | -0.021 | 0.014 |
| -0.686999999999941 | 0.031 | -8.501 | 5.84 | -0.021 | 0.014 |
| -0.683999999999941 | 0.032 | -8.497 | 5.812 | -0.022 | 0.015 |
| -0.680999999999941 | 0.032 | -8.493 | 5.784 | -0.022 | 0.015 |
| -0.677999999999941 | 0.033 | -8.488 | 5.755 | -0.023 | 0.015 |
| -0.674999999999941 | 0.034 | -8.483 | 5.726 | -0.023 | 0.016 |
| -0.671999999999941 | 0.035 | -8.478 | 5.698 | -0.024 | 0.016 |
| -0.668999999999941 | 0.036 | -8.473 | 5.669 | -0.024 | 0.016 |
| -0.665999999999941 | 0.037 | -8.468 | 5.64 | -0.025 | 0.017 |
| -0.662999999999941 | 0.038 | -8.462 | 5.611 | -0.025 | 0.017 |
| -0.659999999999941 | 0.039 | -8.457 | 5.581 | -0.026 | 0.017 |
| -0.656999999999941 | 0.04 | -8.45 | 5.552 | -0.027 | 0.017 |
| -0.653999999999941 | 0.041 | -8.444 | 5.523 | -0.027 | 0.018 |
| -0.650999999999941 | 0.043 | -8.438 | 5.493 | -0.028 | 0.018 |
| -0.647999999999941 | 0.044 | -8.431 | 5.463 | -0.028 | 0.018 |
| -0.644999999999941 | 0.045 | -8.424 | 5.434 | -0.029 | 0.019 |
| -0.641999999999941 | 0.046 | -8.417 | 5.404 | -0.029 | 0.019 |
| -0.638999999999941 | 0.047 | -8.41 | 5.374 | -0.03 | 0.019 |
| -0.635999999999941 | 0.048 | -8.402 | 5.344 | -0.031 | 0.02 |
| -0.632999999999941 | 0.049 | -8.395 | 5.314 | -0.031 | 0.02 |
| -0.629999999999941 | 0.051 | -8.387 | 5.284 | -0.032 | 0.02 |
| -0.626999999999941 | 0.052 | -8.378 | 5.253 | -0.033 | 0.02 |
| -0.623999999999941 | 0.053 | -8.37 | 5.223 | -0.033 | 0.021 |
| -0.620999999999941 | 0.054 | -8.361 | 5.192 | -0.034 | 0.021 |
| -0.617999999999941 | 0.056 | -8.352 | 5.162 | -0.034 | 0.021 |
| -0.614999999999941 | 0.057 | -8.343 | 5.131 | -0.035 | 0.022 |
| -0.611999999999941 | 0.058 | -8.334 | 5.1 | -0.036 | 0.022 |
| -0.608999999999941 | 0.06 | -8.324 | 5.07 | -0.036 | 0.022 |
| -0.605999999999941 | 0.061 | -8.315 | 5.039 | -0.037 | 0.022 |
| -0.602999999999941 | 0.063 | -8.305 | 5.008 | -0.038 | 0.023 |
| -0.599999999999941 | 0.064 | -8.294 | 4.977 | -0.038 | 0.023 |
| -0.596999999999941 | 0.065 | -8.284 | 4.945 | -0.039 | 0.023 |
| -0.593999999999941 | 0.067 | -8.273 | 4.914 | -0.04 | 0.024 |
| -0.590999999999941 | 0.068 | -8.262 | 4.883 | -0.04 | 0.024 |
| -0.587999999999941 | 0.07 | -8.251 | 4.852 | -0.041 | 0.024 |
| -0.584999999999941 | 0.071 | -8.24 | 4.82 | -0.042 | 0.024 |
| -0.581999999999941 | 0.073 | -8.228 | 4.789 | -0.043 | 0.025 |
| -0.578999999999941 | 0.075 | -8.216 | 4.757 | -0.043 | 0.025 |
| -0.575999999999941 | 0.076 | -8.204 | 4.725 | -0.044 | 0.025 |
| -0.572999999999941 | 0.078 | -8.192 | 4.694 | -0.045 | 0.026 |
| -0.569999999999941 | 0.08 | -8.179 | 4.662 | -0.045 | 0.026 |
| -0.566999999999941 | 0.081 | -8.166 | 4.63 | -0.046 | 0.026 |
| -0.563999999999941 | 0.083 | -8.153 | 4.598 | -0.047 | 0.026 |
| -0.560999999999941 | 0.085 | -8.14 | 4.566 | -0.047 | 0.027 |
| -0.557999999999941 | 0.086 | -8.126 | 4.534 | -0.048 | 0.027 |
| -0.554999999999941 | 0.088 | -8.112 | 4.502 | -0.049 | 0.027 |
| -0.551999999999941 | 0.09 | -8.098 | 4.47 | -0.05 | 0.027 |
| -0.548999999999941 | 0.092 | -8.084 | 4.438 | -0.05 | 0.028 |
| -0.545999999999941 | 0.094 | -8.069 | 4.406 | -0.051 | 0.028 |
| -0.542999999999941 | 0.095 | -8.054 | 4.373 | -0.052 | 0.028 |
| -0.539999999999941 | 0.097 | -8.039 | 4.341 | -0.053 | 0.028 |
| -0.536999999999941 | 0.099 | -8.024 | 4.309 | -0.053 | 0.029 |
| -0.533999999999941 | 0.101 | -8.008 | 4.276 | -0.054 | 0.029 |
| -0.530999999999941 | 0.103 | -7.992 | 4.244 | -0.055 | 0.029 |
| -0.527999999999941 | 0.105 | -7.976 | 4.211 | -0.056 | 0.029 |
| -0.524999999999941 | 0.107 | -7.959 | 4.179 | -0.056 | 0.03 |
| -0.521999999999941 | 0.109 | -7.943 | 4.146 | -0.057 | 0.03 |
| -0.518999999999941 | 0.111 | -7.926 | 4.114 | -0.058 | 0.03 |
| -0.515999999999941 | 0.113 | -7.909 | 4.081 | -0.059 | 0.03 |
| -0.512999999999941 | 0.116 | -7.891 | 4.048 | -0.059 | 0.03 |
| -0.509999999999941 | 0.118 | -7.874 | 4.015 | -0.06 | 0.031 |
| -0.506999999999941 | 0.12 | -7.856 | 3.983 | -0.061 | 0.031 |
| -0.503999999999941 | 0.122 | -7.837 | 3.95 | -0.062 | 0.031 |
| -0.500999999999941 | 0.124 | -7.819 | 3.917 | -0.062 | 0.031 |
| -0.497999999999941 | 0.127 | -7.8 | 3.884 | -0.063 | 0.031 |
| -0.494999999999941 | 0.129 | -7.781 | 3.852 | -0.064 | 0.032 |
| -0.491999999999941 | 0.131 | -7.762 | 3.819 | -0.064 | 0.032 |
| -0.488999999999941 | 0.133 | -7.742 | 3.786 | -0.065 | 0.032 |
| -0.485999999999941 | 0.136 | -7.722 | 3.753 | -0.066 | 0.032 |
| -0.482999999999941 | 0.138 | -7.702 | 3.72 | -0.067 | 0.032 |
| -0.479999999999941 | 0.141 | -7.681 | 3.687 | -0.067 | 0.032 |
| -0.476999999999941 | 0.143 | -7.661 | 3.654 | -0.068 | 0.033 |
| -0.473999999999941 | 0.146 | -7.64 | 3.621 | -0.069 | 0.033 |
| -0.470999999999941 | 0.148 | -7.618 | 3.588 | -0.07 | 0.033 |
| -0.467999999999941 | 0.151 | -7.597 | 3.555 | -0.07 | 0.033 |
| -0.464999999999941 | 0.153 | -7.575 | 3.522 | -0.071 | 0.033 |
| -0.461999999999941 | 0.156 | -7.553 | 3.489 | -0.072 | 0.033 |
| -0.458999999999941 | 0.158 | -7.531 | 3.457 | -0.073 | 0.033 |
| -0.455999999999941 | 0.161 | -7.508 | 3.424 | -0.073 | 0.033 |
| -0.452999999999941 | 0.164 | -7.485 | 3.391 | -0.074 | 0.034 |
| -0.449999999999941 | 0.166 | -7.462 | 3.358 | -0.075 | 0.034 |
| -0.446999999999941 | 0.169 | -7.438 | 3.325 | -0.076 | 0.034 |
| -0.443999999999941 | 0.172 | -7.414 | 3.292 | -0.076 | 0.034 |
| -0.440999999999941 | 0.175 | -7.39 | 3.259 | -0.077 | 0.034 |
| -0.437999999999941 | 0.178 | -7.366 | 3.226 | -0.078 | 0.034 |
| -0.434999999999941 | 0.18 | -7.341 | 3.193 | -0.078 | 0.034 |
| -0.431999999999941 | 0.183 | -7.316 | 3.16 | -0.079 | 0.034 |
| -0.428999999999941 | 0.186 | -7.291 | 3.128 | -0.08 | 0.034 |
| -0.425999999999941 | 0.189 | -7.265 | 3.095 | -0.081 | 0.034 |
| -0.422999999999941 | 0.192 | -7.239 | 3.062 | -0.081 | 0.034 |
| -0.419999999999941 | 0.195 | -7.213 | 3.029 | -0.082 | 0.034 |
| -0.416999999999941 | 0.198 | -7.186 | 2.997 | -0.083 | 0.034 |
| -0.413999999999941 | 0.201 | -7.16 | 2.964 | -0.083 | 0.034 |
| -0.410999999999941 | 0.204 | -7.132 | 2.931 | -0.084 | 0.035 |
| -0.407999999999941 | 0.207 | -7.105 | 2.899 | -0.085 | 0.035 |
| -0.404999999999941 | 0.211 | -7.077 | 2.866 | -0.085 | 0.035 |
| -0.401999999999941 | 0.214 | -7.049 | 2.834 | -0.086 | 0.035 |
| -0.398999999999941 | 0.217 | -7.021 | 2.801 | -0.087 | 0.035 |
| -0.395999999999941 | 0.22 | -6.992 | 2.769 | -0.087 | 0.035 |
| -0.392999999999941 | 0.224 | -6.963 | 2.737 | -0.088 | 0.035 |
| -0.389999999999941 | 0.227 | -6.934 | 2.704 | -0.089 | 0.035 |
| -0.386999999999941 | 0.23 | -6.904 | 2.672 | -0.089 | 0.034 |
| -0.383999999999941 | 0.234 | -6.875 | 2.64 | -0.09 | 0.034 |
| -0.380999999999941 | 0.237 | -6.844 | 2.608 | -0.09 | 0.034 |
| -0.377999999999941 | 0.241 | -6.814 | 2.576 | -0.091 | 0.034 |
| -0.374999999999941 | 0.244 | -6.783 | 2.544 | -0.092 | 0.034 |
| -0.371999999999941 | 0.248 | -6.752 | 2.512 | -0.092 | 0.034 |
| -0.368999999999941 | 0.251 | -6.72 | 2.48 | -0.093 | 0.034 |
| -0.365999999999941 | 0.255 | -6.688 | 2.448 | -0.093 | 0.034 |
| -0.362999999999941 | 0.258 | -6.656 | 2.416 | -0.094 | 0.034 |
| -0.359999999999941 | 0.262 | -6.624 | 2.385 | -0.094 | 0.034 |
| -0.356999999999941 | 0.266 | -6.591 | 2.353 | -0.095 | 0.034 |
| -0.353999999999941 | 0.27 | -6.558 | 2.322 | -0.095 | 0.034 |
| -0.350999999999941 | 0.273 | -6.525 | 2.29 | -0.096 | 0.034 |
| -0.347999999999941 | 0.277 | -6.491 | 2.259 | -0.096 | 0.034 |
| -0.344999999999941 | 0.281 | -6.457 | 2.228 | -0.097 | 0.033 |
| -0.341999999999941 | 0.285 | -6.422 | 2.196 | -0.097 | 0.033 |
| -0.338999999999941 | 0.289 | -6.388 | 2.165 | -0.098 | 0.033 |
| -0.335999999999941 | 0.293 | -6.352 | 2.134 | -0.098 | 0.033 |
| -0.332999999999941 | 0.297 | -6.317 | 2.104 | -0.099 | 0.033 |
| -0.329999999999941 | 0.301 | -6.281 | 2.073 | -0.099 | 0.033 |
| -0.326999999999941 | 0.305 | -6.245 | 2.042 | -0.1 | 0.033 |
| -0.323999999999941 | 0.309 | -6.209 | 2.012 | -0.1 | 0.032 |
| -0.320999999999941 | 0.313 | -6.172 | 1.981 | -0.1 | 0.032 |
| -0.317999999999941 | 0.317 | -6.135 | 1.951 | -0.101 | 0.032 |
| -0.314999999999941 | 0.321 | -6.097 | 1.921 | -0.101 | 0.032 |
| -0.311999999999941 | 0.326 | -6.06 | 1.891 | -0.102 | 0.032 |
| -0.308999999999941 | 0.33 | -6.021 | 1.861 | -0.102 | 0.032 |
| -0.305999999999941 | 0.334 | -5.983 | 1.831 | -0.102 | 0.031 |
| -0.302999999999941 | 0.339 | -5.944 | 1.801 | -0.103 | 0.031 |
| -0.299999999999941 | 0.343 | -5.905 | 1.771 | -0.103 | 0.031 |
| -0.296999999999941 | 0.347 | -5.865 | 1.742 | -0.103 | 0.031 |
| -0.293999999999941 | 0.352 | -5.825 | 1.713 | -0.103 | 0.03 |
| -0.290999999999941 | 0.356 | -5.785 | 1.683 | -0.104 | 0.03 |
| -0.287999999999941 | 0.361 | -5.745 | 1.654 | -0.104 | 0.03 |
| -0.284999999999941 | 0.366 | -5.704 | 1.626 | -0.104 | 0.03 |
| -0.281999999999941 | 0.37 | -5.662 | 1.597 | -0.104 | 0.029 |
| -0.278999999999941 | 0.375 | -5.621 | 1.568 | -0.105 | 0.029 |
| -0.275999999999941 | 0.38 | -5.579 | 1.54 | -0.105 | 0.029 |
| -0.272999999999941 | 0.384 | -5.536 | 1.511 | -0.105 | 0.029 |
| -0.269999999999941 | 0.389 | -5.494 | 1.483 | -0.105 | 0.028 |
| -0.266999999999941 | 0.394 | -5.45 | 1.455 | -0.105 | 0.028 |
| -0.263999999999941 | 0.399 | -5.407 | 1.427 | -0.105 | 0.028 |
| -0.260999999999941 | 0.404 | -5.363 | 1.4 | -0.105 | 0.027 |
| -0.257999999999941 | 0.409 | -5.319 | 1.372 | -0.105 | 0.027 |
| -0.254999999999941 | 0.413 | -5.274 | 1.345 | -0.105 | 0.027 |
| -0.251999999999941 | 0.419 | -5.229 | 1.318 | -0.105 | 0.027 |
| -0.248999999999941 | 0.424 | -5.184 | 1.291 | -0.105 | 0.026 |
| -0.245999999999941 | 0.429 | -5.138 | 1.264 | -0.105 | 0.026 |
| -0.242999999999941 | 0.434 | -5.092 | 1.237 | -0.105 | 0.026 |
| -0.239999999999941 | 0.439 | -5.046 | 1.211 | -0.105 | 0.025 |
| -0.236999999999941 | 0.444 | -4.999 | 1.185 | -0.105 | 0.025 |
| -0.233999999999941 | 0.449 | -4.952 | 1.159 | -0.105 | 0.025 |
| -0.230999999999941 | 0.455 | -4.904 | 1.133 | -0.105 | 0.024 |
| -0.227999999999941 | 0.46 | -4.856 | 1.107 | -0.105 | 0.024 |
| -0.224999999999941 | 0.465 | -4.808 | 1.082 | -0.105 | 0.024 |
| -0.221999999999941 | 0.471 | -4.759 | 1.057 | -0.105 | 0.023 |
| -0.218999999999941 | 0.476 | -4.71 | 1.032 | -0.104 | 0.023 |
| -0.215999999999941 | 0.482 | -4.661 | 1.007 | -0.104 | 0.022 |
| -0.212999999999941 | 0.487 | -4.611 | 0.982 | -0.104 | 0.022 |
| -0.209999999999941 | 0.493 | -4.561 | 0.958 | -0.104 | 0.022 |
| -0.206999999999941 | 0.499 | -4.51 | 0.934 | -0.103 | 0.021 |
| -0.203999999999941 | 0.504 | -4.459 | 0.91 | -0.103 | 0.021 |
| -0.200999999999941 | 0.51 | -4.408 | 0.886 | -0.103 | 0.021 |
| -0.197999999999941 | 0.516 | -4.356 | 0.862 | -0.102 | 0.02 |
| -0.194999999999941 | 0.522 | -4.304 | 0.839 | -0.102 | 0.02 |
| -0.191999999999941 | 0.528 | -4.251 | 0.816 | -0.101 | 0.019 |
| -0.188999999999941 | 0.533 | -4.198 | 0.793 | -0.101 | 0.019 |
| -0.185999999999941 | 0.539 | -4.145 | 0.771 | -0.1 | 0.019 |
| -0.182999999999941 | 0.545 | -4.091 | 0.749 | -0.1 | 0.018 |
| -0.179999999999941 | 0.551 | -4.037 | 0.727 | -0.099 | 0.018 |
| -0.176999999999941 | 0.557 | -3.982 | 0.705 | -0.099 | 0.017 |
| -0.173999999999941 | 0.564 | -3.927 | 0.683 | -0.098 | 0.017 |
| -0.170999999999941 | 0.57 | -3.872 | 0.662 | -0.097 | 0.017 |
| -0.167999999999941 | 0.576 | -3.816 | 0.641 | -0.097 | 0.016 |
| -0.164999999999941 | 0.582 | -3.76 | 0.62 | -0.096 | 0.016 |
| -0.161999999999941 | 0.588 | -3.703 | 0.6 | -0.095 | 0.015 |
| -0.158999999999941 | 0.595 | -3.646 | 0.58 | -0.095 | 0.015 |
| -0.155999999999941 | 0.601 | -3.589 | 0.56 | -0.094 | 0.015 |
| -0.152999999999941 | 0.608 | -3.531 | 0.54 | -0.093 | 0.014 |
| -0.149999999999941 | 0.614 | -3.472 | 0.521 | -0.092 | 0.014 |
| -0.146999999999941 | 0.621 | -3.414 | 0.502 | -0.091 | 0.013 |
| -0.143999999999941 | 0.627 | -3.355 | 0.483 | -0.09 | 0.013 |
| -0.140999999999941 | 0.634 | -3.295 | 0.465 | -0.089 | 0.013 |
| -0.137999999999941 | 0.641 | -3.235 | 0.446 | -0.088 | 0.012 |
| -0.134999999999941 | 0.647 | -3.175 | 0.429 | -0.087 | 0.012 |
| -0.131999999999941 | 0.654 | -3.114 | 0.411 | -0.086 | 0.011 |
| -0.128999999999941 | 0.661 | -3.053 | 0.394 | -0.085 | 0.011 |
| -0.125999999999941 | 0.668 | -2.991 | 0.377 | -0.084 | 0.011 |
| -0.122999999999941 | 0.675 | -2.929 | 0.36 | -0.083 | 0.01 |
| -0.119999999999941 | 0.681 | -2.867 | 0.344 | -0.082 | 0.01 |
| -0.116999999999941 | 0.688 | -2.804 | 0.328 | -0.081 | 0.009 |
| -0.113999999999941 | 0.696 | -2.74 | 0.312 | -0.079 | 0.009 |
| -0.110999999999941 | 0.703 | -2.676 | 0.297 | -0.078 | 0.009 |
| -0.107999999999941 | 0.71 | -2.612 | 0.282 | -0.077 | 0.008 |
| -0.104999999999941 | 0.717 | -2.548 | 0.268 | -0.075 | 0.008 |
| -0.101999999999941 | 0.724 | -2.483 | 0.253 | -0.074 | 0.008 |
| -0.0989999999999406 | 0.731 | -2.417 | 0.239 | -0.072 | 0.007 |
| -0.0959999999999406 | 0.739 | -2.351 | 0.226 | -0.071 | 0.007 |
| -0.0929999999999405 | 0.746 | -2.285 | 0.212 | -0.069 | 0.006 |
| -0.0899999999999406 | 0.754 | -2.218 | 0.2 | -0.068 | 0.006 |
| -0.0869999999999406 | 0.761 | -2.151 | 0.187 | -0.066 | 0.006 |
| -0.0839999999999405 | 0.769 | -2.083 | 0.175 | -0.065 | 0.005 |
| -0.0809999999999405 | 0.776 | -2.015 | 0.163 | -0.063 | 0.005 |
| -0.0779999999999406 | 0.784 | -1.946 | 0.152 | -0.061 | 0.005 |
| -0.0749999999999406 | 0.791 | -1.877 | 0.141 | -0.059 | 0.004 |
| -0.0719999999999405 | 0.799 | -1.807 | 0.13 | -0.058 | 0.004 |
| -0.0689999999999405 | 0.807 | -1.737 | 0.12 | -0.056 | 0.004 |
| -0.0659999999999405 | 0.815 | -1.667 | 0.11 | -0.054 | 0.004 |
| -0.0629999999999405 | 0.823 | -1.596 | 0.101 | -0.052 | 0.003 |
| -0.0599999999999405 | 0.831 | -1.525 | 0.091 | -0.05 | 0.003 |
| -0.0569999999999405 | 0.839 | -1.453 | 0.083 | -0.048 | 0.003 |
| -0.0539999999999405 | 0.847 | -1.381 | 0.075 | -0.046 | 0.002 |
| -0.0509999999999405 | 0.855 | -1.308 | 0.067 | -0.044 | 0.002 |
| -0.0479999999999405 | 0.863 | -1.235 | 0.059 | -0.041 | 0.002 |
| -0.0449999999999405 | 0.871 | -1.161 | 0.052 | -0.039 | 0.002 |
| -0.0419999999999405 | 0.879 | -1.087 | 0.046 | -0.037 | 0.002 |
| -0.0389999999999405 | 0.888 | -1.012 | 0.039 | -0.035 | 0.001 |
| -0.0359999999999405 | 0.896 | -0.937 | 0.034 | -0.032 | 0.001 |
| -0.0329999999999405 | 0.904 | -0.862 | 0.028 | -0.03 | 0.001 |
| -0.0299999999999405 | 0.913 | -0.786 | 0.024 | -0.027 | 0.001 |
| -0.0269999999999405 | 0.921 | -0.709 | 0.019 | -0.025 | 0.001 |
| -0.0239999999999405 | 0.93 | -0.633 | 0.015 | -0.022 | 0.001 |
| -0.0209999999999405 | 0.938 | -0.555 | 0.012 | -0.02 | 0 |
| -0.0179999999999405 | 0.947 | -0.477 | 0.009 | -0.017 | 0 |
| -0.0149999999999405 | 0.956 | -0.399 | 0.006 | -0.014 | 0 |
| -0.0119999999999405 | 0.964 | -0.32 | 0.004 | -0.012 | 0 |
| -0.00899999999994053 | 0.973 | -0.241 | 0.002 | -0.009 | 0 |
| -0.00599999999994053 | 0.982 | -0.161 | 0.001 | -0.006 | 0 |
| -0.00299999999994053 | 0.991 | -0.081 | 0 | -0.003 | 0 |
| 5.94723922886509e-14 | 1 | 0 | 0 | 0 | 0 |
| 0.00300000000005947 | 1.009 | 0.081 | 0 | 0.003 | 0 |
| 0.00600000000005947 | 1.018 | 0.163 | 0.001 | 0.006 | 0 |
| 0.00900000000005947 | 1.027 | 0.245 | 0.002 | 0.009 | 0 |
| 0.0120000000000595 | 1.036 | 0.328 | 0.004 | 0.012 | 0 |
| 0.0150000000000595 | 1.046 | 0.411 | 0.006 | 0.016 | 0 |
| 0.0180000000000595 | 1.055 | 0.495 | 0.009 | 0.019 | 0 |
| 0.0210000000000595 | 1.064 | 0.579 | 0.012 | 0.022 | 0 |
| 0.0240000000000595 | 1.074 | 0.664 | 0.016 | 0.026 | 0.001 |
| 0.0270000000000595 | 1.083 | 0.749 | 0.02 | 0.029 | 0.001 |
| 0.0300000000000595 | 1.093 | 0.835 | 0.025 | 0.033 | 0.001 |
| 0.0330000000000595 | 1.102 | 0.921 | 0.03 | 0.036 | 0.001 |
| 0.0360000000000595 | 1.112 | 1.007 | 0.036 | 0.04 | 0.001 |
| 0.0390000000000595 | 1.122 | 1.095 | 0.043 | 0.044 | 0.002 |
| 0.0420000000000595 | 1.131 | 1.182 | 0.05 | 0.048 | 0.002 |
| 0.0450000000000595 | 1.141 | 1.27 | 0.057 | 0.051 | 0.002 |
| 0.0480000000000595 | 1.151 | 1.359 | 0.065 | 0.055 | 0.003 |
| 0.0510000000000595 | 1.161 | 1.448 | 0.074 | 0.059 | 0.003 |
| 0.0540000000000595 | 1.171 | 1.538 | 0.083 | 0.063 | 0.003 |
| 0.0570000000000595 | 1.181 | 1.628 | 0.093 | 0.067 | 0.004 |
| 0.0600000000000595 | 1.191 | 1.719 | 0.103 | 0.071 | 0.004 |
| 0.0630000000000595 | 1.201 | 1.81 | 0.114 | 0.076 | 0.005 |
| 0.0660000000000595 | 1.211 | 1.902 | 0.126 | 0.08 | 0.005 |
| 0.0690000000000595 | 1.222 | 1.995 | 0.138 | 0.084 | 0.006 |
| 0.0720000000000595 | 1.232 | 2.087 | 0.15 | 0.089 | 0.006 |
| 0.0750000000000595 | 1.242 | 2.181 | 0.164 | 0.093 | 0.007 |
| 0.0780000000000595 | 1.253 | 2.275 | 0.177 | 0.098 | 0.008 |
| 0.0810000000000595 | 1.263 | 2.369 | 0.192 | 0.102 | 0.008 |
| 0.0840000000000595 | 1.274 | 2.464 | 0.207 | 0.107 | 0.009 |
| 0.0870000000000595 | 1.284 | 2.559 | 0.223 | 0.112 | 0.01 |
| 0.0900000000000595 | 1.295 | 2.655 | 0.239 | 0.117 | 0.01 |
| 0.0930000000000595 | 1.306 | 2.752 | 0.256 | 0.121 | 0.011 |
| 0.0960000000000595 | 1.317 | 2.849 | 0.273 | 0.126 | 0.012 |
| 0.0990000000000595 | 1.327 | 2.946 | 0.292 | 0.131 | 0.013 |
| 0.10200000000006 | 1.338 | 3.045 | 0.311 | 0.137 | 0.014 |
| 0.10500000000006 | 1.349 | 3.143 | 0.33 | 0.142 | 0.015 |
| 0.10800000000006 | 1.36 | 3.242 | 0.35 | 0.147 | 0.016 |
| 0.11100000000006 | 1.371 | 3.342 | 0.371 | 0.152 | 0.017 |
| 0.11400000000006 | 1.382 | 3.442 | 0.392 | 0.158 | 0.018 |
| 0.11700000000006 | 1.394 | 3.543 | 0.415 | 0.163 | 0.019 |
| 0.12000000000006 | 1.405 | 3.645 | 0.437 | 0.169 | 0.02 |
| 0.12300000000006 | 1.416 | 3.746 | 0.461 | 0.174 | 0.021 |
| 0.12600000000006 | 1.428 | 3.849 | 0.485 | 0.18 | 0.023 |
| 0.12900000000006 | 1.439 | 3.952 | 0.51 | 0.186 | 0.024 |
| 0.13200000000006 | 1.451 | 4.055 | 0.535 | 0.191 | 0.025 |
| 0.13500000000006 | 1.462 | 4.16 | 0.562 | 0.197 | 0.027 |
| 0.13800000000006 | 1.474 | 4.264 | 0.588 | 0.203 | 0.028 |
| 0.14100000000006 | 1.485 | 4.369 | 0.616 | 0.209 | 0.03 |
| 0.14400000000006 | 1.497 | 4.475 | 0.644 | 0.216 | 0.031 |
| 0.14700000000006 | 1.509 | 4.581 | 0.673 | 0.222 | 0.033 |
| 0.15000000000006 | 1.521 | 4.688 | 0.703 | 0.228 | 0.034 |
| 0.15300000000006 | 1.533 | 4.796 | 0.734 | 0.235 | 0.036 |
| 0.15600000000006 | 1.545 | 4.904 | 0.765 | 0.241 | 0.038 |
| 0.15900000000006 | 1.557 | 5.012 | 0.797 | 0.248 | 0.039 |
| 0.16200000000006 | 1.569 | 5.122 | 0.83 | 0.254 | 0.041 |
| 0.16500000000006 | 1.581 | 5.231 | 0.863 | 0.261 | 0.043 |
| 0.16800000000006 | 1.593 | 5.342 | 0.897 | 0.268 | 0.045 |
| 0.17100000000006 | 1.606 | 5.452 | 0.932 | 0.275 | 0.047 |
| 0.17400000000006 | 1.618 | 5.564 | 0.968 | 0.282 | 0.049 |
| 0.17700000000006 | 1.631 | 5.676 | 1.005 | 0.289 | 0.051 |
| 0.18000000000006 | 1.643 | 5.788 | 1.042 | 0.296 | 0.053 |
| 0.18300000000006 | 1.656 | 5.901 | 1.08 | 0.303 | 0.055 |
| 0.18600000000006 | 1.668 | 6.015 | 1.119 | 0.31 | 0.058 |
| 0.18900000000006 | 1.681 | 6.13 | 1.158 | 0.318 | 0.06 |
| 0.19200000000006 | 1.694 | 6.244 | 1.199 | 0.325 | 0.062 |
| 0.19500000000006 | 1.706 | 6.36 | 1.24 | 0.333 | 0.065 |
| 0.19800000000006 | 1.719 | 6.476 | 1.282 | 0.34 | 0.067 |
| 0.20100000000006 | 1.732 | 6.593 | 1.325 | 0.348 | 0.07 |
| 0.20400000000006 | 1.745 | 6.71 | 1.369 | 0.356 | 0.073 |
| 0.20700000000006 | 1.758 | 6.828 | 1.413 | 0.364 | 0.075 |
| 0.21000000000006 | 1.772 | 6.946 | 1.459 | 0.372 | 0.078 |
| 0.21300000000006 | 1.785 | 7.065 | 1.505 | 0.38 | 0.081 |
| 0.21600000000006 | 1.798 | 7.185 | 1.552 | 0.388 | 0.084 |
| 0.21900000000006 | 1.811 | 7.305 | 1.6 | 0.397 | 0.087 |
| 0.22200000000006 | 1.825 | 7.426 | 1.648 | 0.405 | 0.09 |
| 0.22500000000006 | 1.838 | 7.547 | 1.698 | 0.414 | 0.093 |
| 0.22800000000006 | 1.852 | 7.669 | 1.749 | 0.422 | 0.096 |
| 0.23100000000006 | 1.865 | 7.792 | 1.8 | 0.431 | 0.1 |
| 0.23400000000006 | 1.879 | 7.915 | 1.852 | 0.44 | 0.103 |
| 0.23700000000006 | 1.893 | 8.039 | 1.905 | 0.449 | 0.106 |
| 0.24000000000006 | 1.907 | 8.163 | 1.959 | 0.458 | 0.11 |
| 0.24300000000006 | 1.92 | 8.288 | 2.014 | 0.467 | 0.113 |
| 0.24600000000006 | 1.934 | 8.414 | 2.07 | 0.476 | 0.117 |
| 0.24900000000006 | 1.948 | 8.54 | 2.126 | 0.485 | 0.121 |
| 0.25200000000006 | 1.963 | 8.667 | 2.184 | 0.495 | 0.125 |
| 0.25500000000006 | 1.977 | 8.794 | 2.243 | 0.504 | 0.129 |
| 0.25800000000006 | 1.991 | 8.922 | 2.302 | 0.514 | 0.133 |
| 0.26100000000006 | 2.005 | 9.051 | 2.362 | 0.523 | 0.137 |
| 0.26400000000006 | 2.019 | 9.18 | 2.424 | 0.533 | 0.141 |
| 0.26700000000006 | 2.034 | 9.31 | 2.486 | 0.543 | 0.145 |
| 0.27000000000006 | 2.048 | 9.441 | 2.549 | 0.553 | 0.149 |
| 0.27300000000006 | 2.063 | 9.572 | 2.613 | 0.563 | 0.154 |
| 0.27600000000006 | 2.078 | 9.704 | 2.678 | 0.573 | 0.158 |
| 0.27900000000006 | 2.092 | 9.836 | 2.744 | 0.584 | 0.163 |
| 0.28200000000006 | 2.107 | 9.969 | 2.811 | 0.594 | 0.168 |
| 0.28500000000006 | 2.122 | 10.103 | 2.879 | 0.605 | 0.172 |
| 0.28800000000006 | 2.137 | 10.237 | 2.948 | 0.615 | 0.177 |
| 0.29100000000006 | 2.152 | 10.372 | 3.018 | 0.626 | 0.182 |
| 0.29400000000006 | 2.167 | 10.508 | 3.089 | 0.637 | 0.187 |
| 0.29700000000006 | 2.182 | 10.644 | 3.161 | 0.648 | 0.192 |
| 0.30000000000006 | 2.197 | 10.781 | 3.234 | 0.659 | 0.198 |
| 0.30300000000006 | 2.212 | 10.919 | 3.308 | 0.67 | 0.203 |
| 0.30600000000006 | 2.228 | 11.057 | 3.383 | 0.682 | 0.209 |
| 0.30900000000006 | 2.243 | 11.196 | 3.459 | 0.693 | 0.214 |
| 0.31200000000006 | 2.258 | 11.335 | 3.537 | 0.705 | 0.22 |
| 0.31500000000006 | 2.274 | 11.475 | 3.615 | 0.716 | 0.226 |
| 0.31800000000006 | 2.29 | 11.616 | 3.694 | 0.728 | 0.232 |
| 0.32100000000006 | 2.305 | 11.757 | 3.774 | 0.74 | 0.238 |
| 0.32400000000006 | 2.321 | 11.899 | 3.855 | 0.752 | 0.244 |
| 0.32700000000006 | 2.337 | 12.042 | 3.938 | 0.764 | 0.25 |
| 0.33000000000006 | 2.353 | 12.186 | 4.021 | 0.776 | 0.256 |
| 0.33300000000006 | 2.369 | 12.33 | 4.106 | 0.789 | 0.263 |
| 0.33600000000006 | 2.385 | 12.474 | 4.191 | 0.801 | 0.269 |
| 0.33900000000006 | 2.401 | 12.62 | 4.278 | 0.814 | 0.276 |
| 0.34200000000006 | 2.417 | 12.766 | 4.366 | 0.827 | 0.283 |
| 0.34500000000006 | 2.433 | 12.912 | 4.455 | 0.839 | 0.29 |
| 0.34800000000006 | 2.449 | 13.06 | 4.545 | 0.852 | 0.297 |
| 0.35100000000006 | 2.466 | 13.208 | 4.636 | 0.866 | 0.304 |
| 0.35400000000006 | 2.482 | 13.356 | 4.728 | 0.879 | 0.311 |
| 0.35700000000006 | 2.499 | 13.506 | 4.822 | 0.892 | 0.318 |
| 0.36000000000006 | 2.515 | 13.656 | 4.916 | 0.906 | 0.326 |
| 0.36300000000006 | 2.532 | 13.807 | 5.012 | 0.919 | 0.334 |
| 0.36600000000006 | 2.549 | 13.958 | 5.109 | 0.933 | 0.341 |
| 0.36900000000006 | 2.566 | 14.11 | 5.207 | 0.947 | 0.349 |
| 0.37200000000006 | 2.583 | 14.263 | 5.306 | 0.961 | 0.357 |
| 0.37500000000006 | 2.6 | 14.416 | 5.406 | 0.975 | 0.366 |
| 0.37800000000006 | 2.617 | 14.57 | 5.508 | 0.989 | 0.374 |
| 0.38100000000006 | 2.634 | 14.725 | 5.61 | 1.003 | 0.382 |
| 0.38400000000006 | 2.651 | 14.881 | 5.714 | 1.018 | 0.391 |
| 0.38700000000006 | 2.668 | 15.037 | 5.819 | 1.033 | 0.4 |
| 0.39000000000006 | 2.686 | 15.194 | 5.926 | 1.047 | 0.408 |
| 0.39300000000006 | 2.703 | 15.351 | 6.033 | 1.062 | 0.417 |
| 0.39600000000006 | 2.721 | 15.51 | 6.142 | 1.077 | 0.427 |
| 0.39900000000006 | 2.738 | 15.668 | 6.252 | 1.093 | 0.436 |
| 0.40200000000006 | 2.756 | 15.828 | 6.363 | 1.108 | 0.445 |
| 0.40500000000006 | 2.774 | 15.988 | 6.475 | 1.123 | 0.455 |
| 0.40800000000006 | 2.791 | 16.149 | 6.589 | 1.139 | 0.465 |
| 0.41100000000006 | 2.809 | 16.311 | 6.704 | 1.155 | 0.475 |
| 0.41400000000006 | 2.827 | 16.474 | 6.82 | 1.17 | 0.485 |
| 0.41700000000006 | 2.845 | 16.637 | 6.938 | 1.186 | 0.495 |
| 0.42000000000006 | 2.863 | 16.801 | 7.056 | 1.203 | 0.505 |
| 0.42300000000006 | 2.881 | 16.965 | 7.176 | 1.219 | 0.516 |
| 0.42600000000006 | 2.9 | 17.131 | 7.298 | 1.235 | 0.526 |
| 0.42900000000006 | 2.918 | 17.297 | 7.42 | 1.252 | 0.537 |
| 0.43200000000006 | 2.936 | 17.463 | 7.544 | 1.269 | 0.548 |
| 0.43500000000006 | 2.955 | 17.631 | 7.669 | 1.285 | 0.559 |
| 0.43800000000006 | 2.974 | 17.799 | 7.796 | 1.302 | 0.57 |
| 0.44100000000006 | 2.992 | 17.968 | 7.924 | 1.32 | 0.582 |
| 0.44400000000006 | 3.011 | 18.137 | 8.053 | 1.337 | 0.594 |
| 0.44700000000006 | 3.03 | 18.308 | 8.183 | 1.354 | 0.605 |
| 0.45000000000006 | 3.049 | 18.479 | 8.315 | 1.372 | 0.617 |
| 0.45300000000006 | 3.068 | 18.65 | 8.449 | 1.39 | 0.629 |
| 0.45600000000006 | 3.087 | 18.823 | 8.583 | 1.408 | 0.642 |
| 0.45900000000006 | 3.106 | 18.996 | 8.719 | 1.426 | 0.654 |
| 0.46200000000006 | 3.125 | 19.17 | 8.857 | 1.444 | 0.667 |
| 0.46500000000006 | 3.144 | 19.345 | 8.995 | 1.462 | 0.68 |
| 0.46800000000006 | 3.164 | 19.52 | 9.135 | 1.481 | 0.693 |
| 0.47100000000006 | 3.183 | 19.696 | 9.277 | 1.499 | 0.706 |
| 0.47400000000006 | 3.203 | 19.873 | 9.42 | 1.518 | 0.72 |
| 0.47700000000006 | 3.222 | 20.051 | 9.564 | 1.537 | 0.733 |
| 0.48000000000006 | 3.242 | 20.229 | 9.71 | 1.556 | 0.747 |
| 0.48300000000006 | 3.262 | 20.408 | 9.857 | 1.575 | 0.761 |
| 0.48600000000006 | 3.281 | 20.588 | 10.006 | 1.595 | 0.775 |
| 0.48900000000006 | 3.301 | 20.769 | 10.156 | 1.614 | 0.789 |
| 0.49200000000006 | 3.321 | 20.95 | 10.307 | 1.634 | 0.804 |
| 0.49500000000006 | 3.341 | 21.132 | 10.46 | 1.654 | 0.819 |
| 0.49800000000006 | 3.362 | 21.315 | 10.615 | 1.674 | 0.834 |
| 0.50100000000006 | 3.382 | 21.499 | 10.771 | 1.694 | 0.849 |
| 0.50400000000006 | 3.402 | 21.683 | 10.928 | 1.715 | 0.864 |
| 0.50700000000006 | 3.422 | 21.868 | 11.087 | 1.735 | 0.88 |
| 0.51000000000006 | 3.443 | 22.054 | 11.248 | 1.756 | 0.896 |
| 0.51300000000006 | 3.464 | 22.241 | 11.41 | 1.777 | 0.911 |
| 0.51600000000006 | 3.484 | 22.428 | 11.573 | 1.798 | 0.928 |
| 0.51900000000006 | 3.505 | 22.616 | 11.738 | 1.819 | 0.944 |
| 0.52200000000006 | 3.526 | 22.805 | 11.904 | 1.84 | 0.961 |
| 0.52500000000006 | 3.547 | 22.995 | 12.072 | 1.862 | 0.978 |
| 0.52800000000006 | 3.568 | 23.186 | 12.242 | 1.884 | 0.995 |
| 0.53100000000006 | 3.589 | 23.377 | 12.413 | 1.906 | 1.012 |
| 0.53400000000006 | 3.61 | 23.569 | 12.586 | 1.928 | 1.029 |
| 0.53700000000006 | 3.631 | 23.762 | 12.76 | 1.95 | 1.047 |
| 0.54000000000006 | 3.652 | 23.955 | 12.936 | 1.972 | 1.065 |
| 0.54300000000006 | 3.674 | 24.15 | 13.113 | 1.995 | 1.083 |
| 0.54600000000006 | 3.695 | 24.345 | 13.292 | 2.018 | 1.102 |
| 0.54900000000006 | 3.717 | 24.541 | 13.473 | 2.04 | 1.12 |
| 0.55200000000006 | 3.738 | 24.738 | 13.655 | 2.064 | 1.139 |
| 0.55500000000006 | 3.76 | 24.935 | 13.839 | 2.087 | 1.158 |
| 0.55800000000006 | 3.782 | 25.133 | 14.024 | 2.11 | 1.178 |
| 0.56100000000006 | 3.804 | 25.333 | 14.212 | 2.134 | 1.197 |
| 0.56400000000006 | 3.826 | 25.532 | 14.4 | 2.158 | 1.217 |
| 0.56700000000006 | 3.848 | 25.733 | 14.591 | 2.182 | 1.237 |
| 0.57000000000006 | 3.87 | 25.935 | 14.783 | 2.206 | 1.257 |
| 0.57300000000006 | 3.892 | 26.137 | 14.976 | 2.23 | 1.278 |
| 0.57600000000006 | 3.914 | 26.34 | 15.172 | 2.255 | 1.299 |
| 0.57900000000006 | 3.937 | 26.544 | 15.369 | 2.279 | 1.32 |
| 0.58200000000006 | 3.959 | 26.749 | 15.568 | 2.304 | 1.341 |
| 0.58500000000006 | 3.982 | 26.954 | 15.768 | 2.329 | 1.363 |
| 0.58800000000006 | 4.005 | 27.16 | 15.97 | 2.355 | 1.385 |
| 0.59100000000006 | 4.027 | 27.367 | 16.174 | 2.38 | 1.407 |
| 0.59400000000006 | 4.05 | 27.575 | 16.38 | 2.406 | 1.429 |
| 0.59700000000006 | 4.073 | 27.784 | 16.587 | 2.432 | 1.452 |
| 0.60000000000006 | 4.096 | 27.994 | 16.796 | 2.458 | 1.475 |
| 0.60300000000006 | 4.119 | 28.204 | 17.007 | 2.484 | 1.498 |
| 0.60600000000006 | 4.142 | 28.415 | 17.22 | 2.51 | 1.521 |
| 0.60900000000006 | 4.166 | 28.627 | 17.434 | 2.537 | 1.545 |
| 0.61200000000006 | 4.189 | 28.84 | 17.65 | 2.564 | 1.569 |
| 0.61500000000006 | 4.212 | 29.054 | 17.868 | 2.591 | 1.593 |
| 0.61800000000006 | 4.236 | 29.268 | 18.088 | 2.618 | 1.618 |
| 0.62100000000006 | 4.259 | 29.483 | 18.309 | 2.645 | 1.643 |
| 0.62400000000006 | 4.283 | 29.7 | 18.532 | 2.673 | 1.668 |
| 0.62700000000006 | 4.307 | 29.916 | 18.758 | 2.7 | 1.693 |
| 0.63000000000006 | 4.331 | 30.134 | 18.985 | 2.728 | 1.719 |
| 0.63300000000006 | 4.355 | 30.353 | 19.213 | 2.757 | 1.745 |
| 0.63600000000006 | 4.379 | 30.572 | 19.444 | 2.785 | 1.771 |
| 0.63900000000006 | 4.403 | 30.793 | 19.677 | 2.813 | 1.798 |
| 0.64200000000006 | 4.427 | 31.014 | 19.911 | 2.842 | 1.825 |
| 0.64500000000006 | 4.451 | 31.236 | 20.147 | 2.871 | 1.852 |
| 0.64800000000006 | 4.476 | 31.459 | 20.385 | 2.9 | 1.879 |
| 0.65100000000006 | 4.5 | 31.682 | 20.625 | 2.93 | 1.907 |
| 0.65400000000006 | 4.525 | 31.907 | 20.867 | 2.959 | 1.935 |
| 0.65700000000006 | 4.55 | 32.132 | 21.111 | 2.989 | 1.964 |
| 0.66000000000006 | 4.574 | 32.358 | 21.357 | 3.019 | 1.993 |
| 0.66300000000006 | 4.599 | 32.585 | 21.604 | 3.049 | 2.022 |
| 0.66600000000006 | 4.624 | 32.813 | 21.854 | 3.08 | 2.051 |
| 0.66900000000006 | 4.649 | 33.042 | 22.105 | 3.11 | 2.081 |
| 0.67200000000006 | 4.674 | 33.272 | 22.359 | 3.141 | 2.111 |
| 0.67500000000006 | 4.699 | 33.502 | 22.614 | 3.172 | 2.141 |
| 0.67800000000006 | 4.725 | 33.734 | 22.871 | 3.203 | 2.172 |
| 0.68100000000006 | 4.75 | 33.966 | 23.131 | 3.235 | 2.203 |
| 0.68400000000006 | 4.776 | 34.199 | 23.392 | 3.266 | 2.234 |
| 0.68700000000006 | 4.801 | 34.433 | 23.656 | 3.298 | 2.266 |
| 0.69000000000006 | 4.827 | 34.668 | 23.921 | 3.33 | 2.298 |
| 0.69300000000006 | 4.853 | 34.904 | 24.188 | 3.363 | 2.33 |
| 0.69600000000006 | 4.878 | 35.14 | 24.458 | 3.395 | 2.363 |
| 0.69900000000006 | 4.904 | 35.378 | 24.729 | 3.428 | 2.396 |
| 0.70200000000006 | 4.93 | 35.616 | 25.003 | 3.461 | 2.43 |
| 0.70500000000006 | 4.956 | 35.855 | 25.278 | 3.494 | 2.463 |
| 0.70800000000006 | 4.983 | 36.095 | 25.556 | 3.528 | 2.498 |
| 0.71100000000006 | 5.009 | 36.336 | 25.835 | 3.561 | 2.532 |
| 0.71400000000006 | 5.035 | 36.578 | 26.117 | 3.595 | 2.567 |
| 0.71700000000006 | 5.062 | 36.821 | 26.401 | 3.629 | 2.602 |
| 0.72000000000006 | 5.088 | 37.065 | 26.687 | 3.664 | 2.638 |
| 0.72300000000006 | 5.115 | 37.309 | 26.975 | 3.698 | 2.674 |
| 0.72600000000006 | 5.142 | 37.555 | 27.265 | 3.733 | 2.71 |
| 0.72900000000006 | 5.169 | 37.801 | 27.557 | 3.768 | 2.747 |
| 0.73200000000006 | 5.196 | 38.048 | 27.851 | 3.803 | 2.784 |
| 0.73500000000006 | 5.223 | 38.297 | 28.148 | 3.839 | 2.821 |
| 0.73800000000006 | 5.25 | 38.546 | 28.447 | 3.874 | 2.859 |
| 0.74100000000006 | 5.277 | 38.795 | 28.747 | 3.91 | 2.898 |
| 0.74400000000006 | 5.304 | 39.046 | 29.05 | 3.947 | 2.936 |
| 0.74700000000006 | 5.332 | 39.298 | 29.356 | 3.983 | 2.975 |
| 0.75000000000006 | 5.359 | 39.551 | 29.663 | 4.02 | 3.015 |
| 0.75300000000006 | 5.387 | 39.804 | 29.973 | 4.056 | 3.054 |
| 0.75600000000006 | 5.415 | 40.059 | 30.284 | 4.094 | 3.095 |
| 0.75900000000006 | 5.442 | 40.314 | 30.599 | 4.131 | 3.135 |
| 0.76200000000006 | 5.47 | 40.571 | 30.915 | 4.168 | 3.176 |
| 0.76500000000006 | 5.498 | 40.828 | 31.233 | 4.206 | 3.218 |
| 0.76800000000006 | 5.526 | 41.086 | 31.554 | 4.244 | 3.26 |
| 0.77100000000006 | 5.555 | 41.345 | 31.877 | 4.283 | 3.302 |
| 0.77400000000006 | 5.583 | 41.605 | 32.202 | 4.321 | 3.345 |
| 0.77700000000006 | 5.611 | 41.866 | 32.53 | 4.36 | 3.388 |
| 0.78000000000006 | 5.64 | 42.128 | 32.86 | 4.399 | 3.431 |
| 0.78300000000006 | 5.668 | 42.391 | 33.192 | 4.438 | 3.475 |
| 0.78600000000006 | 5.697 | 42.654 | 33.526 | 4.478 | 3.52 |
| 0.78900000000006 | 5.726 | 42.919 | 33.863 | 4.518 | 3.564 |
| 0.79200000000006 | 5.755 | 43.185 | 34.202 | 4.558 | 3.61 |
| 0.79500000000006 | 5.784 | 43.451 | 34.544 | 4.598 | 3.655 |
| 0.79800000000006 | 5.813 | 43.719 | 34.888 | 4.638 | 3.701 |
| 0.80100000000006 | 5.842 | 43.987 | 35.234 | 4.679 | 3.748 |
| 0.80400000000006 | 5.871 | 44.257 | 35.582 | 4.72 | 3.795 |
| 0.80700000000006 | 5.9 | 44.527 | 35.933 | 4.762 | 3.843 |
| 0.81000000000006 | 5.93 | 44.798 | 36.286 | 4.803 | 3.891 |
| 0.81300000000006 | 5.959 | 45.07 | 36.642 | 4.845 | 3.939 |
| 0.81600000000006 | 5.989 | 45.344 | 37 | 4.887 | 3.988 |
| 0.81900000000006 | 6.019 | 45.618 | 37.361 | 4.929 | 4.037 |
| 0.82200000000006 | 6.048 | 45.893 | 37.724 | 4.972 | 4.087 |
| 0.82500000000006 | 6.078 | 46.169 | 38.089 | 5.015 | 4.137 |
| 0.82800000000006 | 6.108 | 46.446 | 38.457 | 5.058 | 4.188 |
| 0.83100000000006 | 6.139 | 46.724 | 38.827 | 5.101 | 4.239 |
| 0.83400000000006 | 6.169 | 47.003 | 39.2 | 5.145 | 4.291 |
| 0.83700000000006 | 6.199 | 47.283 | 39.575 | 5.189 | 4.343 |
| 0.84000000000006 | 6.23 | 47.563 | 39.953 | 5.233 | 4.396 |
| 0.84300000000006 | 6.26 | 47.845 | 40.334 | 5.277 | 4.449 |
| 0.84600000000006 | 6.291 | 48.128 | 40.716 | 5.322 | 4.502 |
| 0.84900000000006 | 6.321 | 48.412 | 41.102 | 5.367 | 4.556 |
| 0.85200000000006 | 6.352 | 48.697 | 41.489 | 5.412 | 4.611 |
| 0.85500000000006 | 6.383 | 48.982 | 41.88 | 5.458 | 4.666 |
| 0.85800000000006 | 6.414 | 49.269 | 42.273 | 5.503 | 4.722 |
| 0.86100000000006 | 6.445 | 49.557 | 42.668 | 5.549 | 4.778 |
| 0.86400000000006 | 6.476 | 49.845 | 43.066 | 5.596 | 4.835 |
| 0.86700000000006 | 6.508 | 50.135 | 43.467 | 5.642 | 4.892 |
| 0.87000000000006 | 6.539 | 50.426 | 43.87 | 5.689 | 4.95 |
| 0.87300000000006 | 6.571 | 50.717 | 44.276 | 5.736 | 5.008 |
| 0.87600000000006 | 6.602 | 51.01 | 44.685 | 5.784 | 5.066 |
| 0.87900000000006 | 6.634 | 51.304 | 45.096 | 5.831 | 5.126 |
| 0.88200000000006 | 6.666 | 51.598 | 45.51 | 5.879 | 5.186 |
| 0.88500000000006 | 6.698 | 51.894 | 45.926 | 5.928 | 5.246 |
| 0.88800000000006 | 6.73 | 52.191 | 46.345 | 5.976 | 5.307 |
| 0.89100000000006 | 6.762 | 52.488 | 46.767 | 6.025 | 5.368 |
| 0.89400000000006 | 6.794 | 52.787 | 47.191 | 6.074 | 5.43 |
| 0.89700000000006 | 6.827 | 53.086 | 47.619 | 6.123 | 5.493 |
| 0.90000000000006 | 6.859 | 53.387 | 48.048 | 6.173 | 5.556 |
| 0.90300000000006 | 6.892 | 53.689 | 48.481 | 6.223 | 5.619 |
| 0.90600000000006 | 6.924 | 53.991 | 48.916 | 6.273 | 5.684 |
| 0.90900000000006 | 6.957 | 54.295 | 49.354 | 6.324 | 5.748 |
| 0.91200000000006 | 6.99 | 54.6 | 49.795 | 6.375 | 5.814 |
| 0.91500000000006 | 7.023 | 54.906 | 50.239 | 6.426 | 5.88 |
| 0.91800000000006 | 7.056 | 55.212 | 50.685 | 6.477 | 5.946 |
| 0.92100000000006 | 7.089 | 55.52 | 51.134 | 6.529 | 6.013 |
| 0.92400000000006 | 7.122 | 55.829 | 51.586 | 6.581 | 6.081 |
| 0.92700000000006 | 7.156 | 56.139 | 52.041 | 6.633 | 6.149 |
| 0.93000000000006 | 7.189 | 56.45 | 52.498 | 6.686 | 6.218 |
| 0.93300000000006 | 7.223 | 56.761 | 52.958 | 6.739 | 6.287 |
| 0.93600000000006 | 7.256 | 57.074 | 53.422 | 6.792 | 6.357 |
| 0.93900000000006 | 7.29 | 57.388 | 53.888 | 6.845 | 6.428 |
| 0.94200000000006 | 7.324 | 57.703 | 54.357 | 6.899 | 6.499 |
| 0.94500000000006 | 7.358 | 58.019 | 54.828 | 6.953 | 6.571 |
| 0.94800000000006 | 7.392 | 58.336 | 55.303 | 7.008 | 6.643 |
| 0.95100000000006 | 7.426 | 58.655 | 55.78 | 7.062 | 6.716 |
| 0.95400000000006 | 7.461 | 58.974 | 56.261 | 7.117 | 6.79 |
| 0.95700000000006 | 7.495 | 59.294 | 56.744 | 7.173 | 6.864 |
| 0.96000000000006 | 7.53 | 59.615 | 57.231 | 7.228 | 6.939 |
| 0.96300000000006 | 7.564 | 59.937 | 57.72 | 7.284 | 7.015 |
| 0.96600000000006 | 7.599 | 60.261 | 58.212 | 7.341 | 7.091 |
| 0.96900000000006 | 7.634 | 60.585 | 58.707 | 7.397 | 7.168 |
| 0.97200000000006 | 7.669 | 60.911 | 59.205 | 7.454 | 7.245 |
| 0.97500000000006 | 7.704 | 61.237 | 59.706 | 7.511 | 7.323 |
| 0.97800000000006 | 7.739 | 61.565 | 60.21 | 7.569 | 7.402 |
| 0.98100000000006 | 7.774 | 61.894 | 60.718 | 7.626 | 7.482 |
| 0.98400000000006 | 7.81 | 62.223 | 61.228 | 7.685 | 7.562 |
| 0.98700000000006 | 7.845 | 62.554 | 61.741 | 7.743 | 7.642 |
| 0.99000000000006 | 7.881 | 62.886 | 62.257 | 7.802 | 7.724 |
| 0.99300000000006 | 7.916 | 63.219 | 62.776 | 7.861 | 7.806 |
| 0.99600000000006 | 7.952 | 63.553 | 63.299 | 7.92 | 7.889 |
| 0.99900000000006 | 7.988 | 63.888 | 63.824 | 7.98 | 7.972 |
| 1.00200000000006 | 8.024 | 64.224 | 64.353 | 8.04 | 8.056 |
| 1.00500000000006 | 8.06 | 64.562 | 64.884 | 8.1 | 8.141 |
| 1.00800000000006 | 8.096 | 64.9 | 65.419 | 8.161 | 8.226 |
| 1.01100000000006 | 8.133 | 65.239 | 65.957 | 8.222 | 8.313 |
| 1.01400000000006 | 8.169 | 65.58 | 66.498 | 8.284 | 8.4 |
| 1.01700000000006 | 8.206 | 65.921 | 67.042 | 8.345 | 8.487 |
| 1.02000000000006 | 8.242 | 66.264 | 67.589 | 8.407 | 8.575 |
| 1.023000000000059 | 8.279 | 66.608 | 68.14 | 8.47 | 8.664 |
| 1.026000000000059 | 8.316 | 66.953 | 68.694 | 8.532 | 8.754 |
| 1.029000000000059 | 8.353 | 67.299 | 69.25 | 8.595 | 8.845 |
| 1.03200000000006 | 8.39 | 67.646 | 69.811 | 8.659 | 8.936 |
| 1.035000000000059 | 8.427 | 67.994 | 70.374 | 8.722 | 9.028 |
| 1.038000000000059 | 8.465 | 68.343 | 70.94 | 8.786 | 9.12 |
| 1.041000000000059 | 8.502 | 68.694 | 71.51 | 8.851 | 9.214 |
| 1.044000000000059 | 8.54 | 69.045 | 72.083 | 8.915 | 9.308 |
| 1.047000000000059 | 8.577 | 69.398 | 72.66 | 8.98 | 9.403 |
| 1.050000000000058 | 8.615 | 69.752 | 73.239 | 9.046 | 9.498 |
| 1.053000000000058 | 8.653 | 70.106 | 73.822 | 9.112 | 9.595 |
| 1.056000000000058 | 8.691 | 70.462 | 74.408 | 9.178 | 9.692 |
| 1.059000000000058 | 8.729 | 70.82 | 74.998 | 9.244 | 9.79 |
| 1.062000000000058 | 8.767 | 71.178 | 75.591 | 9.311 | 9.888 |
| 1.065000000000058 | 8.806 | 71.537 | 76.187 | 9.378 | 9.988 |
| 1.068000000000058 | 8.844 | 71.898 | 76.787 | 9.445 | 10.088 |
| 1.071000000000058 | 8.883 | 72.259 | 77.39 | 9.513 | 10.189 |
| 1.074000000000058 | 8.921 | 72.622 | 77.996 | 9.581 | 10.29 |
| 1.077000000000057 | 8.96 | 72.986 | 78.606 | 9.65 | 10.393 |
| 1.080000000000057 | 8.999 | 73.351 | 79.219 | 9.719 | 10.496 |
| 1.083000000000057 | 9.038 | 73.717 | 79.835 | 9.788 | 10.6 |
| 1.086000000000057 | 9.077 | 74.084 | 80.455 | 9.858 | 10.705 |
| 1.089000000000057 | 9.116 | 74.452 | 81.079 | 9.928 | 10.811 |
| 1.092000000000057 | 9.156 | 74.822 | 81.706 | 9.998 | 10.918 |
| 1.095000000000057 | 9.195 | 75.193 | 82.336 | 10.069 | 11.025 |
| 1.098000000000057 | 9.235 | 75.565 | 82.97 | 10.14 | 11.133 |
| 1.101000000000057 | 9.274 | 75.938 | 83.607 | 10.211 | 11.242 |
| 1.104000000000056 | 9.314 | 76.312 | 84.248 | 10.283 | 11.352 |
| 1.107000000000056 | 9.354 | 76.687 | 84.893 | 10.355 | 11.463 |
| 1.110000000000056 | 9.394 | 77.063 | 85.54 | 10.427 | 11.574 |
| 1.113000000000056 | 9.434 | 77.441 | 86.192 | 10.5 | 11.687 |
| 1.116000000000056 | 9.474 | 77.82 | 86.847 | 10.573 | 11.8 |
| 1.119000000000056 | 9.515 | 78.2 | 87.506 | 10.647 | 11.914 |
| 1.122000000000056 | 9.555 | 78.581 | 88.168 | 10.721 | 12.029 |
| 1.125000000000056 | 9.596 | 78.963 | 88.834 | 10.795 | 12.145 |
| 1.128000000000056 | 9.636 | 79.347 | 89.503 | 10.87 | 12.261 |
| 1.131000000000056 | 9.677 | 79.731 | 90.176 | 10.945 | 12.379 |
| 1.134000000000055 | 9.718 | 80.117 | 90.853 | 11.02 | 12.497 |
| 1.137000000000055 | 9.759 | 80.504 | 91.533 | 11.096 | 12.616 |
| 1.140000000000055 | 9.8 | 80.892 | 92.217 | 11.172 | 12.737 |
| 1.143000000000055 | 9.842 | 81.281 | 92.905 | 11.249 | 12.858 |
| 1.146000000000055 | 9.883 | 81.672 | 93.596 | 11.326 | 12.98 |
| 1.149000000000055 | 9.925 | 82.064 | 94.291 | 11.403 | 13.102 |
| 1.152000000000055 | 9.966 | 82.456 | 94.99 | 11.481 | 13.226 |
| 1.155000000000055 | 10.008 | 82.85 | 95.692 | 11.559 | 13.351 |
| 1.158000000000055 | 10.05 | 83.246 | 96.399 | 11.638 | 13.476 |
| 1.161000000000054 | 10.092 | 83.642 | 97.109 | 11.716 | 13.603 |
| 1.164000000000054 | 10.134 | 84.04 | 97.822 | 11.796 | 13.73 |
| 1.167000000000054 | 10.176 | 84.439 | 98.54 | 11.875 | 13.859 |
| 1.170000000000054 | 10.218 | 84.839 | 99.261 | 11.955 | 13.988 |
| 1.173000000000054 | 10.261 | 85.24 | 99.986 | 12.036 | 14.118 |
| 1.176000000000054 | 10.303 | 85.642 | 100.715 | 12.117 | 14.249 |
| 1.179000000000054 | 10.346 | 86.046 | 101.448 | 12.198 | 14.381 |
| 1.182000000000054 | 10.389 | 86.451 | 102.185 | 12.28 | 14.514 |
| 1.185000000000054 | 10.432 | 86.857 | 102.926 | 12.362 | 14.648 |
| 1.188000000000053 | 10.475 | 87.264 | 103.67 | 12.444 | 14.783 |
| 1.191000000000053 | 10.518 | 87.673 | 104.418 | 12.527 | 14.919 |
| 1.194000000000053 | 10.561 | 88.082 | 105.17 | 12.61 | 15.056 |
| 1.197000000000053 | 10.604 | 88.493 | 105.927 | 12.694 | 15.194 |
| 1.200000000000053 | 10.648 | 88.906 | 106.687 | 12.778 | 15.333 |
| 1.203000000000053 | 10.692 | 89.319 | 107.451 | 12.862 | 15.473 |
| 1.206000000000053 | 10.735 | 89.734 | 108.219 | 12.947 | 15.614 |
| 1.209000000000053 | 10.779 | 90.149 | 108.991 | 13.032 | 15.756 |
| 1.212000000000053 | 10.823 | 90.567 | 109.767 | 13.118 | 15.899 |
| 1.215000000000052 | 10.867 | 90.985 | 110.547 | 13.204 | 16.043 |
| 1.218000000000052 | 10.912 | 91.404 | 111.331 | 13.29 | 16.187 |
| 1.221000000000052 | 10.956 | 91.825 | 112.119 | 13.377 | 16.333 |
| 1.224000000000052 | 11 | 92.247 | 112.911 | 13.464 | 16.48 |
| 1.227000000000052 | 11.045 | 92.67 | 113.707 | 13.552 | 16.628 |
| 1.230000000000052 | 11.09 | 93.095 | 114.507 | 13.64 | 16.777 |
| 1.233000000000052 | 11.134 | 93.521 | 115.311 | 13.729 | 16.927 |
| 1.236000000000052 | 11.179 | 93.948 | 116.119 | 13.818 | 17.079 |
| 1.239000000000052 | 11.224 | 94.376 | 116.932 | 13.907 | 17.231 |
| 1.242000000000051 | 11.27 | 94.806 | 117.748 | 13.997 | 17.384 |
| 1.245000000000051 | 11.315 | 95.236 | 118.569 | 14.087 | 17.538 |
| 1.248000000000051 | 11.36 | 95.668 | 119.394 | 14.178 | 17.694 |
| 1.251000000000051 | 11.406 | 96.102 | 120.223 | 14.269 | 17.85 |
| 1.254000000000051 | 11.451 | 96.536 | 121.056 | 14.36 | 18.008 |
| 1.257000000000051 | 11.497 | 96.972 | 121.894 | 14.452 | 18.166 |
| 1.260000000000051 | 11.543 | 97.409 | 122.735 | 14.544 | 18.326 |
| 1.263000000000051 | 11.589 | 97.847 | 123.581 | 14.637 | 18.487 |
| 1.266000000000051 | 11.635 | 98.287 | 124.431 | 14.73 | 18.649 |
| 1.269000000000051 | 11.682 | 98.728 | 125.286 | 14.824 | 18.812 |
| 1.27200000000005 | 11.728 | 99.17 | 126.144 | 14.918 | 18.976 |
| 1.27500000000005 | 11.775 | 99.614 | 127.007 | 15.013 | 19.141 |
| 1.27800000000005 | 11.821 | 100.058 | 127.875 | 15.107 | 19.307 |
| 1.28100000000005 | 11.868 | 100.504 | 128.746 | 15.203 | 19.475 |
| 1.28400000000005 | 11.915 | 100.952 | 129.622 | 15.299 | 19.643 |
| 1.28700000000005 | 11.962 | 101.4 | 130.502 | 15.395 | 19.813 |
| 1.29000000000005 | 12.009 | 101.85 | 131.387 | 15.492 | 19.984 |
| 1.29300000000005 | 12.056 | 102.301 | 132.276 | 15.589 | 20.156 |
| 1.29600000000005 | 12.104 | 102.754 | 133.169 | 15.686 | 20.329 |
| 1.299000000000049 | 12.151 | 103.208 | 134.067 | 15.784 | 20.504 |
| 1.302000000000049 | 12.199 | 103.663 | 134.969 | 15.883 | 20.679 |
| 1.305000000000049 | 12.247 | 104.119 | 135.875 | 15.982 | 20.856 |
| 1.30800000000005 | 12.294 | 104.577 | 136.786 | 16.081 | 21.034 |
| 1.311000000000049 | 12.342 | 105.036 | 137.702 | 16.181 | 21.213 |
| 1.314000000000049 | 12.391 | 105.496 | 138.622 | 16.281 | 21.393 |
| 1.317000000000049 | 12.439 | 105.958 | 139.546 | 16.382 | 21.575 |
| 1.320000000000049 | 12.487 | 106.42 | 140.475 | 16.483 | 21.758 |
| 1.323000000000049 | 12.536 | 106.885 | 141.408 | 16.585 | 21.942 |
| 1.326000000000048 | 12.584 | 107.35 | 142.346 | 16.687 | 22.127 |
| 1.329000000000048 | 12.633 | 107.817 | 143.289 | 16.789 | 22.313 |
| 1.332000000000048 | 12.682 | 108.285 | 144.236 | 16.892 | 22.501 |
| 1.335000000000048 | 12.731 | 108.755 | 145.188 | 16.996 | 22.689 |
| 1.338000000000048 | 12.78 | 109.226 | 146.144 | 17.1 | 22.879 |
| 1.341000000000048 | 12.829 | 109.698 | 147.105 | 17.204 | 23.071 |
| 1.344000000000048 | 12.879 | 110.171 | 148.07 | 17.309 | 23.263 |
| 1.347000000000048 | 12.928 | 110.646 | 149.04 | 17.414 | 23.457 |
| 1.350000000000048 | 12.978 | 111.122 | 150.015 | 17.52 | 23.652 |
| 1.353000000000047 | 13.028 | 111.6 | 150.995 | 17.626 | 23.849 |
| 1.356000000000047 | 13.078 | 112.079 | 151.979 | 17.733 | 24.046 |
| 1.359000000000047 | 13.128 | 112.559 | 152.968 | 17.84 | 24.245 |
| 1.362000000000047 | 13.178 | 113.041 | 153.961 | 17.948 | 24.445 |
| 1.365000000000047 | 13.228 | 113.523 | 154.959 | 18.056 | 24.647 |
| 1.368000000000047 | 13.278 | 114.008 | 155.962 | 18.165 | 24.849 |
| 1.371000000000047 | 13.329 | 114.493 | 156.97 | 18.274 | 25.054 |
| 1.374000000000047 | 13.38 | 114.98 | 157.983 | 18.384 | 25.259 |
| 1.377000000000047 | 13.43 | 115.469 | 159 | 18.494 | 25.466 |
| 1.380000000000046 | 13.481 | 115.958 | 160.022 | 18.604 | 25.674 |
| 1.383000000000046 | 13.532 | 116.449 | 161.049 | 18.715 | 25.883 |
| 1.386000000000046 | 13.583 | 116.942 | 162.081 | 18.827 | 26.094 |
| 1.389000000000046 | 13.635 | 117.435 | 163.118 | 18.939 | 26.306 |
| 1.392000000000046 | 13.686 | 117.931 | 164.159 | 19.051 | 26.519 |
| 1.395000000000046 | 13.738 | 118.427 | 165.206 | 19.164 | 26.734 |
| 1.398000000000046 | 13.789 | 118.925 | 166.257 | 19.278 | 26.95 |
| 1.401000000000046 | 13.841 | 119.424 | 167.313 | 19.392 | 27.168 |
| 1.404000000000046 | 13.893 | 119.925 | 168.374 | 19.506 | 27.387 |
| 1.407000000000046 | 13.945 | 120.427 | 169.441 | 19.621 | 27.607 |
| 1.410000000000045 | 13.998 | 120.93 | 170.512 | 19.737 | 27.828 |
| 1.413000000000045 | 14.05 | 121.435 | 171.588 | 19.852 | 28.052 |
| 1.416000000000045 | 14.102 | 121.941 | 172.669 | 19.969 | 28.276 |
| 1.419000000000045 | 14.155 | 122.449 | 173.755 | 20.086 | 28.502 |
| 1.422000000000045 | 14.208 | 122.958 | 174.846 | 20.203 | 28.729 |
| 1.425000000000045 | 14.261 | 123.468 | 175.942 | 20.321 | 28.958 |
| 1.428000000000045 | 14.314 | 123.98 | 177.043 | 20.44 | 29.188 |
| 1.431000000000045 | 14.367 | 124.493 | 178.149 | 20.559 | 29.419 |
| 1.434000000000045 | 14.42 | 125.008 | 179.261 | 20.678 | 29.652 |
| 1.437000000000044 | 14.473 | 125.524 | 180.377 | 20.798 | 29.887 |
| 1.440000000000044 | 14.527 | 126.041 | 181.499 | 20.919 | 30.123 |
| 1.443000000000044 | 14.58 | 126.56 | 182.626 | 21.04 | 30.36 |
| 1.446000000000044 | 14.634 | 127.08 | 183.757 | 21.161 | 30.599 |
| 1.449000000000044 | 14.688 | 127.601 | 184.894 | 21.283 | 30.839 |
| 1.452000000000044 | 14.742 | 128.124 | 186.037 | 21.406 | 31.081 |
| 1.455000000000044 | 14.796 | 128.649 | 187.184 | 21.529 | 31.324 |
| 1.458000000000044 | 14.851 | 129.175 | 188.337 | 21.652 | 31.569 |
| 1.461000000000044 | 14.905 | 129.702 | 189.495 | 21.776 | 31.815 |
| 1.464000000000043 | 14.96 | 130.231 | 190.658 | 21.901 | 32.063 |
| 1.467000000000043 | 15.014 | 130.761 | 191.826 | 22.026 | 32.312 |
| 1.470000000000043 | 15.069 | 131.292 | 193 | 22.152 | 32.563 |
| 1.473000000000043 | 15.124 | 131.826 | 194.179 | 22.278 | 32.815 |
| 1.476000000000043 | 15.179 | 132.36 | 195.363 | 22.405 | 33.069 |
| 1.479000000000043 | 15.235 | 132.896 | 196.553 | 22.532 | 33.325 |
| 1.482000000000043 | 15.29 | 133.433 | 197.748 | 22.66 | 33.582 |
| 1.485000000000043 | 15.345 | 133.972 | 198.948 | 22.788 | 33.84 |
| 1.488000000000043 | 15.401 | 134.512 | 200.154 | 22.917 | 34.1 |
| 1.491000000000042 | 15.457 | 135.054 | 201.365 | 23.046 | 34.362 |
| 1.494000000000042 | 15.513 | 135.597 | 202.582 | 23.176 | 34.625 |
| 1.497000000000042 | 15.569 | 136.141 | 203.804 | 23.307 | 34.89 |
| 1.500000000000042 | 15.625 | 136.688 | 205.031 | 23.438 | 35.156 |